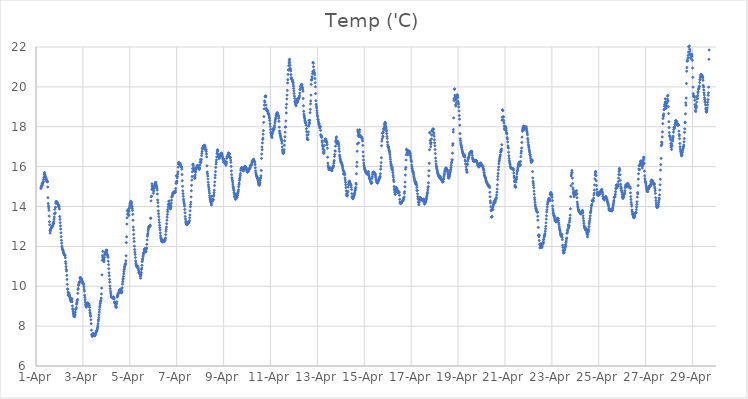
| Category | Temp ('C) |
|---|---|
| 44287.208333333336 | 14.903 |
| 44287.21875 | 14.95 |
| 44287.229166666664 | 15.001 |
| 44287.239583333336 | 15.046 |
| 44287.25 | 15.058 |
| 44287.260416666664 | 15.142 |
| 44287.270833333336 | 15.089 |
| 44287.28125 | 15.154 |
| 44287.291666666664 | 15.194 |
| 44287.302083333336 | 15.213 |
| 44287.3125 | 15.263 |
| 44287.322916666664 | 15.357 |
| 44287.333333333336 | 15.464 |
| 44287.34375 | 15.629 |
| 44287.354166666664 | 15.635 |
| 44287.364583333336 | 15.705 |
| 44287.375 | 15.594 |
| 44287.385416666664 | 15.562 |
| 44287.395833333336 | 15.508 |
| 44287.40625 | 15.463 |
| 44287.416666666664 | 15.451 |
| 44287.427083333336 | 15.418 |
| 44287.4375 | 15.367 |
| 44287.447916666664 | 15.304 |
| 44287.458333333336 | 15.279 |
| 44287.46875 | 15.247 |
| 44287.479166666664 | 15.288 |
| 44287.489583333336 | 15.234 |
| 44287.5 | 14.98 |
| 44287.510416666664 | 14.443 |
| 44287.520833333336 | 14.15 |
| 44287.53125 | 14.023 |
| 44287.541666666664 | 13.929 |
| 44287.552083333336 | 13.81 |
| 44287.5625 | 13.517 |
| 44287.572916666664 | 13.237 |
| 44287.583333333336 | 13.085 |
| 44287.59375 | 12.813 |
| 44287.604166666664 | 12.665 |
| 44287.614583333336 | 12.771 |
| 44287.625 | 12.871 |
| 44287.635416666664 | 12.89 |
| 44287.645833333336 | 12.92 |
| 44287.65625 | 12.944 |
| 44287.666666666664 | 12.97 |
| 44287.677083333336 | 12.98 |
| 44287.6875 | 12.992 |
| 44287.697916666664 | 12.995 |
| 44287.708333333336 | 13.023 |
| 44287.71875 | 13.065 |
| 44287.729166666664 | 13.16 |
| 44287.739583333336 | 13.167 |
| 44287.75 | 13.137 |
| 44287.760416666664 | 13.241 |
| 44287.770833333336 | 13.358 |
| 44287.78125 | 13.471 |
| 44287.791666666664 | 13.627 |
| 44287.802083333336 | 13.861 |
| 44287.8125 | 13.677 |
| 44287.822916666664 | 13.676 |
| 44287.833333333336 | 13.96 |
| 44287.84375 | 14.161 |
| 44287.854166666664 | 14.255 |
| 44287.864583333336 | 14.182 |
| 44287.875 | 14.214 |
| 44287.885416666664 | 14.247 |
| 44287.895833333336 | 14.212 |
| 44287.90625 | 14.196 |
| 44287.916666666664 | 14.177 |
| 44287.927083333336 | 14.136 |
| 44287.9375 | 14.108 |
| 44287.947916666664 | 14.099 |
| 44287.958333333336 | 14.041 |
| 44287.96875 | 13.979 |
| 44287.979166666664 | 14.015 |
| 44287.989583333336 | 13.98 |
| 44288.0 | 13.872 |
| 44288.010416666664 | 13.496 |
| 44288.020833333336 | 13.351 |
| 44288.03125 | 13.186 |
| 44288.041666666664 | 13.024 |
| 44288.052083333336 | 12.872 |
| 44288.0625 | 12.681 |
| 44288.072916666664 | 12.486 |
| 44288.083333333336 | 12.303 |
| 44288.09375 | 12.159 |
| 44288.104166666664 | 12.015 |
| 44288.114583333336 | 11.929 |
| 44288.125 | 11.856 |
| 44288.135416666664 | 11.847 |
| 44288.145833333336 | 11.818 |
| 44288.15625 | 11.776 |
| 44288.166666666664 | 11.723 |
| 44288.177083333336 | 11.68 |
| 44288.1875 | 11.628 |
| 44288.197916666664 | 11.61 |
| 44288.208333333336 | 11.568 |
| 44288.21875 | 11.571 |
| 44288.229166666664 | 11.555 |
| 44288.239583333336 | 11.559 |
| 44288.25 | 11.431 |
| 44288.260416666664 | 11.233 |
| 44288.270833333336 | 11.133 |
| 44288.28125 | 10.983 |
| 44288.291666666664 | 10.846 |
| 44288.302083333336 | 10.765 |
| 44288.3125 | 10.547 |
| 44288.322916666664 | 10.342 |
| 44288.333333333336 | 10.097 |
| 44288.34375 | 9.862 |
| 44288.354166666664 | 9.849 |
| 44288.364583333336 | 9.705 |
| 44288.375 | 9.547 |
| 44288.385416666664 | 9.57 |
| 44288.395833333336 | 9.642 |
| 44288.40625 | 9.667 |
| 44288.416666666664 | 9.592 |
| 44288.427083333336 | 9.5 |
| 44288.4375 | 9.496 |
| 44288.447916666664 | 9.447 |
| 44288.458333333336 | 9.39 |
| 44288.46875 | 9.329 |
| 44288.479166666664 | 9.283 |
| 44288.489583333336 | 9.267 |
| 44288.5 | 9.228 |
| 44288.510416666664 | 9.276 |
| 44288.520833333336 | 9.373 |
| 44288.53125 | 9.367 |
| 44288.541666666664 | 9.231 |
| 44288.552083333336 | 9.011 |
| 44288.5625 | 8.871 |
| 44288.572916666664 | 8.823 |
| 44288.583333333336 | 8.725 |
| 44288.59375 | 8.653 |
| 44288.604166666664 | 8.583 |
| 44288.614583333336 | 8.525 |
| 44288.625 | 8.49 |
| 44288.635416666664 | 8.484 |
| 44288.645833333336 | 8.476 |
| 44288.65625 | 8.542 |
| 44288.666666666664 | 8.591 |
| 44288.677083333336 | 8.704 |
| 44288.6875 | 8.832 |
| 44288.697916666664 | 8.853 |
| 44288.708333333336 | 8.889 |
| 44288.71875 | 8.928 |
| 44288.729166666664 | 9.091 |
| 44288.739583333336 | 9.155 |
| 44288.75 | 9.197 |
| 44288.760416666664 | 9.288 |
| 44288.770833333336 | 9.339 |
| 44288.78125 | 9.646 |
| 44288.791666666664 | 9.835 |
| 44288.802083333336 | 9.886 |
| 44288.8125 | 10.043 |
| 44288.822916666664 | 10.08 |
| 44288.833333333336 | 10.124 |
| 44288.84375 | 10.181 |
| 44288.854166666664 | 10.213 |
| 44288.864583333336 | 10.235 |
| 44288.875 | 10.424 |
| 44288.885416666664 | 10.379 |
| 44288.895833333336 | 10.437 |
| 44288.90625 | 10.432 |
| 44288.916666666664 | 10.391 |
| 44288.927083333336 | 10.372 |
| 44288.9375 | 10.359 |
| 44288.947916666664 | 10.319 |
| 44288.958333333336 | 10.272 |
| 44288.96875 | 10.252 |
| 44288.979166666664 | 10.228 |
| 44288.989583333336 | 10.15 |
| 44289.0 | 10.121 |
| 44289.010416666664 | 10.127 |
| 44289.020833333336 | 10.151 |
| 44289.03125 | 10.085 |
| 44289.041666666664 | 9.977 |
| 44289.052083333336 | 9.847 |
| 44289.0625 | 9.752 |
| 44289.072916666664 | 9.556 |
| 44289.083333333336 | 9.443 |
| 44289.09375 | 9.317 |
| 44289.104166666664 | 9.202 |
| 44289.114583333336 | 9.093 |
| 44289.125 | 9.024 |
| 44289.135416666664 | 8.977 |
| 44289.145833333336 | 8.952 |
| 44289.15625 | 8.994 |
| 44289.166666666664 | 9.071 |
| 44289.177083333336 | 9.113 |
| 44289.1875 | 9.143 |
| 44289.197916666664 | 9.154 |
| 44289.208333333336 | 9.148 |
| 44289.21875 | 9.136 |
| 44289.229166666664 | 9.117 |
| 44289.239583333336 | 9.11 |
| 44289.25 | 9.076 |
| 44289.260416666664 | 9.096 |
| 44289.270833333336 | 9.017 |
| 44289.28125 | 8.942 |
| 44289.291666666664 | 8.795 |
| 44289.302083333336 | 8.688 |
| 44289.3125 | 8.614 |
| 44289.322916666664 | 8.515 |
| 44289.333333333336 | 8.497 |
| 44289.34375 | 8.32 |
| 44289.354166666664 | 8.125 |
| 44289.364583333336 | 7.795 |
| 44289.375 | 7.576 |
| 44289.385416666664 | 7.566 |
| 44289.395833333336 | 7.485 |
| 44289.40625 | 7.521 |
| 44289.416666666664 | 7.602 |
| 44289.427083333336 | 7.629 |
| 44289.4375 | 7.615 |
| 44289.447916666664 | 7.603 |
| 44289.458333333336 | 7.562 |
| 44289.46875 | 7.57 |
| 44289.479166666664 | 7.546 |
| 44289.489583333336 | 7.513 |
| 44289.5 | 7.526 |
| 44289.510416666664 | 7.552 |
| 44289.520833333336 | 7.568 |
| 44289.53125 | 7.566 |
| 44289.541666666664 | 7.597 |
| 44289.552083333336 | 7.667 |
| 44289.5625 | 7.723 |
| 44289.572916666664 | 7.756 |
| 44289.583333333336 | 7.728 |
| 44289.59375 | 7.762 |
| 44289.604166666664 | 7.807 |
| 44289.614583333336 | 7.862 |
| 44289.625 | 7.928 |
| 44289.635416666664 | 8.014 |
| 44289.645833333336 | 8.125 |
| 44289.65625 | 8.26 |
| 44289.666666666664 | 8.33 |
| 44289.677083333336 | 8.437 |
| 44289.6875 | 8.567 |
| 44289.697916666664 | 8.708 |
| 44289.708333333336 | 8.83 |
| 44289.71875 | 8.955 |
| 44289.729166666664 | 9.051 |
| 44289.739583333336 | 9.143 |
| 44289.75 | 9.226 |
| 44289.760416666664 | 9.244 |
| 44289.770833333336 | 9.29 |
| 44289.78125 | 9.405 |
| 44289.791666666664 | 9.614 |
| 44289.802083333336 | 9.907 |
| 44289.8125 | 10.572 |
| 44289.822916666664 | 11.305 |
| 44289.833333333336 | 11.536 |
| 44289.84375 | 11.754 |
| 44289.854166666664 | 11.449 |
| 44289.864583333336 | 11.399 |
| 44289.875 | 11.355 |
| 44289.885416666664 | 11.424 |
| 44289.895833333336 | 11.228 |
| 44289.90625 | 11.313 |
| 44289.916666666664 | 11.455 |
| 44289.927083333336 | 11.579 |
| 44289.9375 | 11.663 |
| 44289.947916666664 | 11.631 |
| 44289.958333333336 | 11.683 |
| 44289.96875 | 11.702 |
| 44289.979166666664 | 11.735 |
| 44289.989583333336 | 11.812 |
| 44290.0 | 11.785 |
| 44290.010416666664 | 11.812 |
| 44290.020833333336 | 11.797 |
| 44290.03125 | 11.667 |
| 44290.041666666664 | 11.573 |
| 44290.052083333336 | 11.548 |
| 44290.0625 | 11.513 |
| 44290.072916666664 | 11.447 |
| 44290.083333333336 | 11.257 |
| 44290.09375 | 11.086 |
| 44290.104166666664 | 10.879 |
| 44290.114583333336 | 10.673 |
| 44290.125 | 10.526 |
| 44290.135416666664 | 10.342 |
| 44290.145833333336 | 10.203 |
| 44290.15625 | 10.014 |
| 44290.166666666664 | 9.881 |
| 44290.177083333336 | 9.754 |
| 44290.1875 | 9.656 |
| 44290.197916666664 | 9.567 |
| 44290.208333333336 | 9.487 |
| 44290.21875 | 9.451 |
| 44290.229166666664 | 9.442 |
| 44290.239583333336 | 9.436 |
| 44290.25 | 9.427 |
| 44290.260416666664 | 9.42 |
| 44290.270833333336 | 9.418 |
| 44290.28125 | 9.415 |
| 44290.291666666664 | 9.415 |
| 44290.302083333336 | 9.463 |
| 44290.3125 | 9.443 |
| 44290.322916666664 | 9.388 |
| 44290.333333333336 | 9.361 |
| 44290.34375 | 9.214 |
| 44290.354166666664 | 9.165 |
| 44290.364583333336 | 9.154 |
| 44290.375 | 9.201 |
| 44290.385416666664 | 9.152 |
| 44290.395833333336 | 9.029 |
| 44290.40625 | 8.954 |
| 44290.416666666664 | 8.972 |
| 44290.427083333336 | 8.943 |
| 44290.4375 | 9.119 |
| 44290.447916666664 | 9.221 |
| 44290.458333333336 | 9.453 |
| 44290.46875 | 9.524 |
| 44290.479166666664 | 9.548 |
| 44290.489583333336 | 9.512 |
| 44290.5 | 9.618 |
| 44290.510416666664 | 9.63 |
| 44290.520833333336 | 9.644 |
| 44290.53125 | 9.686 |
| 44290.541666666664 | 9.739 |
| 44290.552083333336 | 9.801 |
| 44290.5625 | 9.798 |
| 44290.572916666664 | 9.804 |
| 44290.583333333336 | 9.809 |
| 44290.59375 | 9.837 |
| 44290.604166666664 | 9.853 |
| 44290.614583333336 | 9.839 |
| 44290.625 | 9.727 |
| 44290.635416666664 | 9.67 |
| 44290.645833333336 | 9.685 |
| 44290.65625 | 9.689 |
| 44290.666666666664 | 9.76 |
| 44290.677083333336 | 9.92 |
| 44290.6875 | 10.107 |
| 44290.697916666664 | 10.225 |
| 44290.708333333336 | 10.332 |
| 44290.71875 | 10.392 |
| 44290.729166666664 | 10.496 |
| 44290.739583333336 | 10.627 |
| 44290.75 | 10.734 |
| 44290.760416666664 | 10.837 |
| 44290.770833333336 | 10.917 |
| 44290.78125 | 10.981 |
| 44290.791666666664 | 11.053 |
| 44290.802083333336 | 11.107 |
| 44290.8125 | 11.09 |
| 44290.822916666664 | 11.148 |
| 44290.833333333336 | 11.279 |
| 44290.84375 | 11.53 |
| 44290.854166666664 | 12.187 |
| 44290.864583333336 | 12.479 |
| 44290.875 | 13.119 |
| 44290.885416666664 | 13.434 |
| 44290.895833333336 | 13.796 |
| 44290.90625 | 13.624 |
| 44290.916666666664 | 13.808 |
| 44290.927083333336 | 13.733 |
| 44290.9375 | 13.851 |
| 44290.947916666664 | 13.607 |
| 44290.958333333336 | 13.55 |
| 44290.96875 | 13.758 |
| 44290.979166666664 | 13.896 |
| 44290.989583333336 | 13.968 |
| 44291.0 | 14.061 |
| 44291.010416666664 | 14.148 |
| 44291.020833333336 | 14.19 |
| 44291.03125 | 14.181 |
| 44291.041666666664 | 14.261 |
| 44291.052083333336 | 14.227 |
| 44291.0625 | 14.212 |
| 44291.072916666664 | 14.142 |
| 44291.083333333336 | 14.041 |
| 44291.09375 | 14.001 |
| 44291.104166666664 | 13.898 |
| 44291.114583333336 | 13.803 |
| 44291.125 | 13.606 |
| 44291.135416666664 | 13.309 |
| 44291.145833333336 | 12.973 |
| 44291.15625 | 12.823 |
| 44291.166666666664 | 12.603 |
| 44291.177083333336 | 12.409 |
| 44291.1875 | 12.247 |
| 44291.197916666664 | 12.013 |
| 44291.208333333336 | 11.843 |
| 44291.21875 | 11.712 |
| 44291.229166666664 | 11.593 |
| 44291.239583333336 | 11.44 |
| 44291.25 | 11.263 |
| 44291.260416666664 | 11.149 |
| 44291.270833333336 | 11.092 |
| 44291.28125 | 11.049 |
| 44291.291666666664 | 11.014 |
| 44291.302083333336 | 10.988 |
| 44291.3125 | 10.965 |
| 44291.322916666664 | 10.945 |
| 44291.333333333336 | 10.937 |
| 44291.34375 | 11.001 |
| 44291.354166666664 | 10.928 |
| 44291.364583333336 | 10.871 |
| 44291.375 | 10.803 |
| 44291.385416666664 | 10.714 |
| 44291.395833333336 | 10.692 |
| 44291.40625 | 10.707 |
| 44291.416666666664 | 10.633 |
| 44291.427083333336 | 10.623 |
| 44291.4375 | 10.603 |
| 44291.447916666664 | 10.506 |
| 44291.458333333336 | 10.403 |
| 44291.46875 | 10.521 |
| 44291.479166666664 | 10.57 |
| 44291.489583333336 | 10.692 |
| 44291.5 | 10.842 |
| 44291.510416666664 | 10.905 |
| 44291.520833333336 | 11.047 |
| 44291.53125 | 11.234 |
| 44291.541666666664 | 11.31 |
| 44291.552083333336 | 11.38 |
| 44291.5625 | 11.486 |
| 44291.572916666664 | 11.556 |
| 44291.583333333336 | 11.623 |
| 44291.59375 | 11.687 |
| 44291.604166666664 | 11.697 |
| 44291.614583333336 | 11.83 |
| 44291.625 | 11.856 |
| 44291.635416666664 | 11.888 |
| 44291.645833333336 | 11.848 |
| 44291.65625 | 11.861 |
| 44291.666666666664 | 11.77 |
| 44291.677083333336 | 11.725 |
| 44291.6875 | 11.755 |
| 44291.697916666664 | 11.885 |
| 44291.708333333336 | 11.884 |
| 44291.71875 | 11.914 |
| 44291.729166666664 | 12.103 |
| 44291.739583333336 | 12.327 |
| 44291.75 | 12.504 |
| 44291.760416666664 | 12.582 |
| 44291.770833333336 | 12.658 |
| 44291.78125 | 12.775 |
| 44291.791666666664 | 12.858 |
| 44291.802083333336 | 12.92 |
| 44291.8125 | 12.971 |
| 44291.822916666664 | 12.984 |
| 44291.833333333336 | 12.995 |
| 44291.84375 | 13.022 |
| 44291.854166666664 | 12.991 |
| 44291.864583333336 | 13.024 |
| 44291.875 | 13.056 |
| 44291.885416666664 | 13.405 |
| 44291.895833333336 | 13.419 |
| 44291.90625 | 14.282 |
| 44291.916666666664 | 14.49 |
| 44291.927083333336 | 14.519 |
| 44291.9375 | 14.865 |
| 44291.947916666664 | 15.139 |
| 44291.958333333336 | 15.012 |
| 44291.96875 | 14.88 |
| 44291.979166666664 | 14.967 |
| 44291.989583333336 | 15.017 |
| 44292.0 | 14.816 |
| 44292.010416666664 | 14.665 |
| 44292.020833333336 | 14.779 |
| 44292.03125 | 14.901 |
| 44292.041666666664 | 14.953 |
| 44292.052083333336 | 15.013 |
| 44292.0625 | 15.06 |
| 44292.072916666664 | 15.118 |
| 44292.083333333336 | 15.113 |
| 44292.09375 | 15.2 |
| 44292.104166666664 | 15.216 |
| 44292.114583333336 | 15.177 |
| 44292.125 | 15.087 |
| 44292.135416666664 | 15.044 |
| 44292.145833333336 | 14.98 |
| 44292.15625 | 14.904 |
| 44292.166666666664 | 14.823 |
| 44292.177083333336 | 14.632 |
| 44292.1875 | 14.326 |
| 44292.197916666664 | 14.195 |
| 44292.208333333336 | 14.01 |
| 44292.21875 | 13.782 |
| 44292.229166666664 | 13.636 |
| 44292.239583333336 | 13.49 |
| 44292.25 | 13.337 |
| 44292.260416666664 | 13.201 |
| 44292.270833333336 | 13.06 |
| 44292.28125 | 12.945 |
| 44292.291666666664 | 12.823 |
| 44292.302083333336 | 12.675 |
| 44292.3125 | 12.531 |
| 44292.322916666664 | 12.435 |
| 44292.333333333336 | 12.385 |
| 44292.34375 | 12.311 |
| 44292.354166666664 | 12.288 |
| 44292.364583333336 | 12.264 |
| 44292.375 | 12.23 |
| 44292.385416666664 | 12.233 |
| 44292.395833333336 | 12.225 |
| 44292.40625 | 12.292 |
| 44292.416666666664 | 12.326 |
| 44292.427083333336 | 12.273 |
| 44292.4375 | 12.259 |
| 44292.447916666664 | 12.278 |
| 44292.458333333336 | 12.27 |
| 44292.46875 | 12.258 |
| 44292.479166666664 | 12.282 |
| 44292.489583333336 | 12.259 |
| 44292.5 | 12.304 |
| 44292.510416666664 | 12.366 |
| 44292.520833333336 | 12.419 |
| 44292.53125 | 12.589 |
| 44292.541666666664 | 12.757 |
| 44292.552083333336 | 12.858 |
| 44292.5625 | 12.971 |
| 44292.572916666664 | 13.138 |
| 44292.583333333336 | 13.314 |
| 44292.59375 | 13.465 |
| 44292.604166666664 | 13.599 |
| 44292.614583333336 | 13.739 |
| 44292.625 | 13.85 |
| 44292.635416666664 | 13.974 |
| 44292.645833333336 | 14.093 |
| 44292.65625 | 14.126 |
| 44292.666666666664 | 14.254 |
| 44292.677083333336 | 14.282 |
| 44292.6875 | 14.113 |
| 44292.697916666664 | 14.066 |
| 44292.708333333336 | 14.106 |
| 44292.71875 | 14.044 |
| 44292.729166666664 | 13.919 |
| 44292.739583333336 | 13.878 |
| 44292.75 | 13.927 |
| 44292.760416666664 | 14.006 |
| 44292.770833333336 | 14.166 |
| 44292.78125 | 14.315 |
| 44292.791666666664 | 14.469 |
| 44292.802083333336 | 14.496 |
| 44292.8125 | 14.524 |
| 44292.822916666664 | 14.593 |
| 44292.833333333336 | 14.654 |
| 44292.84375 | 14.678 |
| 44292.854166666664 | 14.696 |
| 44292.864583333336 | 14.701 |
| 44292.875 | 14.715 |
| 44292.885416666664 | 14.725 |
| 44292.895833333336 | 14.715 |
| 44292.90625 | 14.678 |
| 44292.916666666664 | 14.71 |
| 44292.927083333336 | 14.7 |
| 44292.9375 | 14.713 |
| 44292.947916666664 | 14.778 |
| 44292.958333333336 | 14.908 |
| 44292.96875 | 15.16 |
| 44292.979166666664 | 15.545 |
| 44292.989583333336 | 15.248 |
| 44293.0 | 15.175 |
| 44293.010416666664 | 15.269 |
| 44293.020833333336 | 15.434 |
| 44293.03125 | 15.51 |
| 44293.041666666664 | 15.633 |
| 44293.052083333336 | 15.74 |
| 44293.0625 | 15.972 |
| 44293.072916666664 | 16.127 |
| 44293.083333333336 | 16.192 |
| 44293.09375 | 16.194 |
| 44293.104166666664 | 16.205 |
| 44293.114583333336 | 16.2 |
| 44293.125 | 16.138 |
| 44293.135416666664 | 16.128 |
| 44293.145833333336 | 16.1 |
| 44293.15625 | 16.129 |
| 44293.166666666664 | 16.099 |
| 44293.177083333336 | 16.01 |
| 44293.1875 | 16.014 |
| 44293.197916666664 | 16.009 |
| 44293.208333333336 | 15.958 |
| 44293.21875 | 15.868 |
| 44293.229166666664 | 15.601 |
| 44293.239583333336 | 15.293 |
| 44293.25 | 15.011 |
| 44293.260416666664 | 14.787 |
| 44293.270833333336 | 14.645 |
| 44293.28125 | 14.511 |
| 44293.291666666664 | 14.372 |
| 44293.302083333336 | 14.273 |
| 44293.3125 | 14.186 |
| 44293.322916666664 | 14.115 |
| 44293.333333333336 | 14.018 |
| 44293.34375 | 13.853 |
| 44293.354166666664 | 13.688 |
| 44293.364583333336 | 13.5 |
| 44293.375 | 13.372 |
| 44293.385416666664 | 13.264 |
| 44293.395833333336 | 13.19 |
| 44293.40625 | 13.145 |
| 44293.416666666664 | 13.111 |
| 44293.427083333336 | 13.09 |
| 44293.4375 | 13.085 |
| 44293.447916666664 | 13.091 |
| 44293.458333333336 | 13.192 |
| 44293.46875 | 13.132 |
| 44293.479166666664 | 13.168 |
| 44293.489583333336 | 13.165 |
| 44293.5 | 13.155 |
| 44293.510416666664 | 13.177 |
| 44293.520833333336 | 13.243 |
| 44293.53125 | 13.232 |
| 44293.541666666664 | 13.287 |
| 44293.552083333336 | 13.436 |
| 44293.5625 | 13.576 |
| 44293.572916666664 | 13.784 |
| 44293.583333333336 | 13.989 |
| 44293.59375 | 14.1 |
| 44293.604166666664 | 14.216 |
| 44293.614583333336 | 14.478 |
| 44293.625 | 14.787 |
| 44293.635416666664 | 15.062 |
| 44293.645833333336 | 15.322 |
| 44293.65625 | 15.505 |
| 44293.666666666664 | 15.744 |
| 44293.677083333336 | 15.901 |
| 44293.6875 | 16.095 |
| 44293.697916666664 | 16.132 |
| 44293.708333333336 | 16.06 |
| 44293.71875 | 15.958 |
| 44293.729166666664 | 15.878 |
| 44293.739583333336 | 15.792 |
| 44293.75 | 15.807 |
| 44293.760416666664 | 15.528 |
| 44293.770833333336 | 15.406 |
| 44293.78125 | 15.46 |
| 44293.791666666664 | 15.579 |
| 44293.802083333336 | 15.711 |
| 44293.8125 | 15.783 |
| 44293.822916666664 | 15.877 |
| 44293.833333333336 | 15.912 |
| 44293.84375 | 15.933 |
| 44293.854166666664 | 15.961 |
| 44293.864583333336 | 16.015 |
| 44293.875 | 16.041 |
| 44293.885416666664 | 16.053 |
| 44293.895833333336 | 16.053 |
| 44293.90625 | 16.039 |
| 44293.916666666664 | 16.007 |
| 44293.927083333336 | 15.961 |
| 44293.9375 | 15.936 |
| 44293.947916666664 | 15.921 |
| 44293.958333333336 | 15.856 |
| 44293.96875 | 15.896 |
| 44293.979166666664 | 15.94 |
| 44293.989583333336 | 16.071 |
| 44294.0 | 16.215 |
| 44294.010416666664 | 16.352 |
| 44294.020833333336 | 16.232 |
| 44294.03125 | 16.197 |
| 44294.041666666664 | 16.273 |
| 44294.052083333336 | 16.363 |
| 44294.0625 | 16.553 |
| 44294.072916666664 | 16.669 |
| 44294.083333333336 | 16.768 |
| 44294.09375 | 16.912 |
| 44294.104166666664 | 16.889 |
| 44294.114583333336 | 16.947 |
| 44294.125 | 17.011 |
| 44294.135416666664 | 16.989 |
| 44294.145833333336 | 17.022 |
| 44294.15625 | 17.038 |
| 44294.166666666664 | 17.037 |
| 44294.177083333336 | 17.057 |
| 44294.1875 | 17.072 |
| 44294.197916666664 | 17.052 |
| 44294.208333333336 | 17.024 |
| 44294.21875 | 16.948 |
| 44294.229166666664 | 16.841 |
| 44294.239583333336 | 16.858 |
| 44294.25 | 16.84 |
| 44294.260416666664 | 16.758 |
| 44294.270833333336 | 16.633 |
| 44294.28125 | 16.484 |
| 44294.291666666664 | 16.04 |
| 44294.302083333336 | 15.729 |
| 44294.3125 | 15.639 |
| 44294.322916666664 | 15.528 |
| 44294.333333333336 | 15.381 |
| 44294.34375 | 15.217 |
| 44294.354166666664 | 15.077 |
| 44294.364583333336 | 14.976 |
| 44294.375 | 14.883 |
| 44294.385416666664 | 14.781 |
| 44294.395833333336 | 14.669 |
| 44294.40625 | 14.538 |
| 44294.416666666664 | 14.455 |
| 44294.427083333336 | 14.366 |
| 44294.4375 | 14.313 |
| 44294.447916666664 | 14.252 |
| 44294.458333333336 | 14.228 |
| 44294.46875 | 14.185 |
| 44294.479166666664 | 14.075 |
| 44294.489583333336 | 14.14 |
| 44294.5 | 14.512 |
| 44294.510416666664 | 14.359 |
| 44294.520833333336 | 14.355 |
| 44294.53125 | 14.307 |
| 44294.541666666664 | 14.279 |
| 44294.552083333336 | 14.338 |
| 44294.5625 | 14.357 |
| 44294.572916666664 | 14.52 |
| 44294.583333333336 | 14.571 |
| 44294.59375 | 14.698 |
| 44294.604166666664 | 14.818 |
| 44294.614583333336 | 15.05 |
| 44294.625 | 15.229 |
| 44294.635416666664 | 15.439 |
| 44294.645833333336 | 15.573 |
| 44294.65625 | 15.754 |
| 44294.666666666664 | 15.96 |
| 44294.677083333336 | 16.128 |
| 44294.6875 | 16.224 |
| 44294.697916666664 | 16.337 |
| 44294.708333333336 | 16.484 |
| 44294.71875 | 16.661 |
| 44294.729166666664 | 16.738 |
| 44294.739583333336 | 16.84 |
| 44294.75 | 16.833 |
| 44294.760416666664 | 16.789 |
| 44294.770833333336 | 16.615 |
| 44294.78125 | 16.521 |
| 44294.791666666664 | 16.584 |
| 44294.802083333336 | 16.469 |
| 44294.8125 | 16.398 |
| 44294.822916666664 | 16.446 |
| 44294.833333333336 | 16.491 |
| 44294.84375 | 16.524 |
| 44294.854166666664 | 16.561 |
| 44294.864583333336 | 16.595 |
| 44294.875 | 16.617 |
| 44294.885416666664 | 16.649 |
| 44294.895833333336 | 16.674 |
| 44294.90625 | 16.672 |
| 44294.916666666664 | 16.661 |
| 44294.927083333336 | 16.625 |
| 44294.9375 | 16.589 |
| 44294.947916666664 | 16.521 |
| 44294.958333333336 | 16.465 |
| 44294.96875 | 16.407 |
| 44294.979166666664 | 16.35 |
| 44294.989583333336 | 16.22 |
| 44295.0 | 16.377 |
| 44295.010416666664 | 16.364 |
| 44295.020833333336 | 16.294 |
| 44295.03125 | 16.267 |
| 44295.041666666664 | 16.251 |
| 44295.052083333336 | 16.255 |
| 44295.0625 | 16.216 |
| 44295.072916666664 | 16.188 |
| 44295.083333333336 | 16.138 |
| 44295.09375 | 16.118 |
| 44295.104166666664 | 16.067 |
| 44295.114583333336 | 16.158 |
| 44295.125 | 16.238 |
| 44295.135416666664 | 16.414 |
| 44295.145833333336 | 16.495 |
| 44295.15625 | 16.465 |
| 44295.166666666664 | 16.501 |
| 44295.177083333336 | 16.545 |
| 44295.1875 | 16.596 |
| 44295.197916666664 | 16.637 |
| 44295.208333333336 | 16.676 |
| 44295.21875 | 16.671 |
| 44295.229166666664 | 16.679 |
| 44295.239583333336 | 16.657 |
| 44295.25 | 16.617 |
| 44295.260416666664 | 16.497 |
| 44295.270833333336 | 16.471 |
| 44295.28125 | 16.467 |
| 44295.291666666664 | 16.445 |
| 44295.302083333336 | 16.327 |
| 44295.3125 | 16.213 |
| 44295.322916666664 | 16.011 |
| 44295.333333333336 | 15.788 |
| 44295.34375 | 15.599 |
| 44295.354166666664 | 15.446 |
| 44295.364583333336 | 15.387 |
| 44295.375 | 15.313 |
| 44295.385416666664 | 15.229 |
| 44295.395833333336 | 15.117 |
| 44295.40625 | 15.008 |
| 44295.416666666664 | 14.936 |
| 44295.427083333336 | 14.868 |
| 44295.4375 | 14.808 |
| 44295.447916666664 | 14.701 |
| 44295.458333333336 | 14.619 |
| 44295.46875 | 14.506 |
| 44295.479166666664 | 14.453 |
| 44295.489583333336 | 14.536 |
| 44295.5 | 14.467 |
| 44295.510416666664 | 14.356 |
| 44295.520833333336 | 14.598 |
| 44295.53125 | 14.63 |
| 44295.541666666664 | 14.588 |
| 44295.552083333336 | 14.501 |
| 44295.5625 | 14.448 |
| 44295.572916666664 | 14.463 |
| 44295.583333333336 | 14.54 |
| 44295.59375 | 14.559 |
| 44295.604166666664 | 14.648 |
| 44295.614583333336 | 14.699 |
| 44295.625 | 14.769 |
| 44295.635416666664 | 14.845 |
| 44295.645833333336 | 14.994 |
| 44295.65625 | 15.097 |
| 44295.666666666664 | 15.176 |
| 44295.677083333336 | 15.308 |
| 44295.6875 | 15.386 |
| 44295.697916666664 | 15.474 |
| 44295.708333333336 | 15.559 |
| 44295.71875 | 15.657 |
| 44295.729166666664 | 15.817 |
| 44295.739583333336 | 15.879 |
| 44295.75 | 15.886 |
| 44295.760416666664 | 15.939 |
| 44295.770833333336 | 15.934 |
| 44295.78125 | 15.94 |
| 44295.791666666664 | 15.937 |
| 44295.802083333336 | 15.9 |
| 44295.8125 | 15.869 |
| 44295.822916666664 | 15.818 |
| 44295.833333333336 | 15.785 |
| 44295.84375 | 15.792 |
| 44295.854166666664 | 15.832 |
| 44295.864583333336 | 15.872 |
| 44295.875 | 15.91 |
| 44295.885416666664 | 15.955 |
| 44295.895833333336 | 15.985 |
| 44295.90625 | 16.001 |
| 44295.916666666664 | 16.011 |
| 44295.927083333336 | 16.004 |
| 44295.9375 | 15.982 |
| 44295.947916666664 | 15.964 |
| 44295.958333333336 | 15.942 |
| 44295.96875 | 15.901 |
| 44295.979166666664 | 15.863 |
| 44295.989583333336 | 15.801 |
| 44296.0 | 15.764 |
| 44296.010416666664 | 15.741 |
| 44296.020833333336 | 15.731 |
| 44296.03125 | 15.725 |
| 44296.041666666664 | 15.772 |
| 44296.052083333336 | 15.819 |
| 44296.0625 | 15.784 |
| 44296.072916666664 | 15.839 |
| 44296.083333333336 | 15.842 |
| 44296.09375 | 15.889 |
| 44296.104166666664 | 15.89 |
| 44296.114583333336 | 15.924 |
| 44296.125 | 15.966 |
| 44296.135416666664 | 15.938 |
| 44296.145833333336 | 16.046 |
| 44296.15625 | 16.058 |
| 44296.166666666664 | 16.082 |
| 44296.177083333336 | 16.078 |
| 44296.1875 | 16.098 |
| 44296.197916666664 | 16.13 |
| 44296.208333333336 | 16.219 |
| 44296.21875 | 16.267 |
| 44296.229166666664 | 16.275 |
| 44296.239583333336 | 16.276 |
| 44296.25 | 16.319 |
| 44296.260416666664 | 16.351 |
| 44296.270833333336 | 16.297 |
| 44296.28125 | 16.369 |
| 44296.291666666664 | 16.333 |
| 44296.302083333336 | 16.272 |
| 44296.3125 | 16.272 |
| 44296.322916666664 | 16.243 |
| 44296.333333333336 | 16.193 |
| 44296.34375 | 16.101 |
| 44296.354166666664 | 15.94 |
| 44296.364583333336 | 15.788 |
| 44296.375 | 15.686 |
| 44296.385416666664 | 15.628 |
| 44296.395833333336 | 15.571 |
| 44296.40625 | 15.53 |
| 44296.416666666664 | 15.505 |
| 44296.427083333336 | 15.482 |
| 44296.4375 | 15.447 |
| 44296.447916666664 | 15.411 |
| 44296.458333333336 | 15.36 |
| 44296.46875 | 15.287 |
| 44296.479166666664 | 15.224 |
| 44296.489583333336 | 15.162 |
| 44296.5 | 15.117 |
| 44296.510416666664 | 15.084 |
| 44296.520833333336 | 15.06 |
| 44296.53125 | 15.111 |
| 44296.541666666664 | 15.136 |
| 44296.552083333336 | 15.211 |
| 44296.5625 | 15.327 |
| 44296.572916666664 | 15.425 |
| 44296.583333333336 | 15.426 |
| 44296.59375 | 15.539 |
| 44296.604166666664 | 15.809 |
| 44296.614583333336 | 16.411 |
| 44296.625 | 16.628 |
| 44296.635416666664 | 16.987 |
| 44296.645833333336 | 16.848 |
| 44296.65625 | 17.185 |
| 44296.666666666664 | 17.363 |
| 44296.677083333336 | 17.437 |
| 44296.6875 | 17.627 |
| 44296.697916666664 | 17.807 |
| 44296.708333333336 | 18.216 |
| 44296.71875 | 18.511 |
| 44296.729166666664 | 18.902 |
| 44296.739583333336 | 19.083 |
| 44296.75 | 19.298 |
| 44296.760416666664 | 19.228 |
| 44296.770833333336 | 19.513 |
| 44296.78125 | 19.531 |
| 44296.791666666664 | 19.546 |
| 44296.802083333336 | 19.496 |
| 44296.8125 | 19.087 |
| 44296.822916666664 | 18.922 |
| 44296.833333333336 | 18.816 |
| 44296.84375 | 18.855 |
| 44296.854166666664 | 18.803 |
| 44296.864583333336 | 18.816 |
| 44296.875 | 18.785 |
| 44296.885416666664 | 18.755 |
| 44296.895833333336 | 18.69 |
| 44296.90625 | 18.664 |
| 44296.916666666664 | 18.655 |
| 44296.927083333336 | 18.608 |
| 44296.9375 | 18.543 |
| 44296.947916666664 | 18.485 |
| 44296.958333333336 | 18.409 |
| 44296.96875 | 18.308 |
| 44296.979166666664 | 18.153 |
| 44296.989583333336 | 18.016 |
| 44297.0 | 17.862 |
| 44297.010416666664 | 17.723 |
| 44297.020833333336 | 17.663 |
| 44297.03125 | 17.587 |
| 44297.041666666664 | 17.551 |
| 44297.052083333336 | 17.52 |
| 44297.0625 | 17.459 |
| 44297.072916666664 | 17.622 |
| 44297.083333333336 | 17.683 |
| 44297.09375 | 17.893 |
| 44297.104166666664 | 17.757 |
| 44297.114583333336 | 17.861 |
| 44297.125 | 17.853 |
| 44297.135416666664 | 17.865 |
| 44297.145833333336 | 17.877 |
| 44297.15625 | 17.936 |
| 44297.166666666664 | 17.981 |
| 44297.177083333336 | 18.07 |
| 44297.1875 | 18.19 |
| 44297.197916666664 | 18.274 |
| 44297.208333333336 | 18.348 |
| 44297.21875 | 18.412 |
| 44297.229166666664 | 18.48 |
| 44297.239583333336 | 18.559 |
| 44297.25 | 18.61 |
| 44297.260416666664 | 18.646 |
| 44297.270833333336 | 18.664 |
| 44297.28125 | 18.694 |
| 44297.291666666664 | 18.703 |
| 44297.302083333336 | 18.694 |
| 44297.3125 | 18.627 |
| 44297.322916666664 | 18.586 |
| 44297.333333333336 | 18.566 |
| 44297.34375 | 18.513 |
| 44297.354166666664 | 18.426 |
| 44297.364583333336 | 18.273 |
| 44297.375 | 17.98 |
| 44297.385416666664 | 17.784 |
| 44297.395833333336 | 17.692 |
| 44297.40625 | 17.648 |
| 44297.416666666664 | 17.587 |
| 44297.427083333336 | 17.541 |
| 44297.4375 | 17.475 |
| 44297.447916666664 | 17.428 |
| 44297.458333333336 | 17.371 |
| 44297.46875 | 17.35 |
| 44297.479166666664 | 17.28 |
| 44297.489583333336 | 17.172 |
| 44297.5 | 16.988 |
| 44297.510416666664 | 16.841 |
| 44297.520833333336 | 16.741 |
| 44297.53125 | 16.687 |
| 44297.541666666664 | 16.671 |
| 44297.552083333336 | 16.68 |
| 44297.5625 | 16.696 |
| 44297.572916666664 | 16.739 |
| 44297.583333333336 | 16.85 |
| 44297.59375 | 17.072 |
| 44297.604166666664 | 17.297 |
| 44297.614583333336 | 17.5 |
| 44297.625 | 17.731 |
| 44297.635416666664 | 17.99 |
| 44297.645833333336 | 17.98 |
| 44297.65625 | 18.291 |
| 44297.666666666664 | 18.95 |
| 44297.677083333336 | 18.692 |
| 44297.6875 | 19.126 |
| 44297.697916666664 | 19.391 |
| 44297.708333333336 | 19.588 |
| 44297.71875 | 19.824 |
| 44297.729166666664 | 20.199 |
| 44297.739583333336 | 20.358 |
| 44297.75 | 20.624 |
| 44297.760416666664 | 20.844 |
| 44297.770833333336 | 20.856 |
| 44297.78125 | 21.066 |
| 44297.791666666664 | 21.206 |
| 44297.802083333336 | 21.315 |
| 44297.8125 | 21.384 |
| 44297.822916666664 | 21.225 |
| 44297.833333333336 | 21.086 |
| 44297.84375 | 20.933 |
| 44297.854166666664 | 20.868 |
| 44297.864583333336 | 20.797 |
| 44297.875 | 20.617 |
| 44297.885416666664 | 20.469 |
| 44297.895833333336 | 20.429 |
| 44297.90625 | 20.389 |
| 44297.916666666664 | 20.369 |
| 44297.927083333336 | 20.351 |
| 44297.9375 | 20.318 |
| 44297.947916666664 | 20.273 |
| 44297.958333333336 | 20.219 |
| 44297.96875 | 20.141 |
| 44297.979166666664 | 20.041 |
| 44297.989583333336 | 19.921 |
| 44298.0 | 19.801 |
| 44298.010416666664 | 19.669 |
| 44298.020833333336 | 19.536 |
| 44298.03125 | 19.42 |
| 44298.041666666664 | 19.28 |
| 44298.052083333336 | 19.221 |
| 44298.0625 | 19.18 |
| 44298.072916666664 | 19.133 |
| 44298.083333333336 | 19.095 |
| 44298.09375 | 19.052 |
| 44298.104166666664 | 19.198 |
| 44298.114583333336 | 19.232 |
| 44298.125 | 19.345 |
| 44298.135416666664 | 19.385 |
| 44298.145833333336 | 19.238 |
| 44298.15625 | 19.235 |
| 44298.166666666664 | 19.318 |
| 44298.177083333336 | 19.376 |
| 44298.1875 | 19.399 |
| 44298.197916666664 | 19.451 |
| 44298.208333333336 | 19.449 |
| 44298.21875 | 19.45 |
| 44298.229166666664 | 19.502 |
| 44298.239583333336 | 19.561 |
| 44298.25 | 19.69 |
| 44298.260416666664 | 19.867 |
| 44298.270833333336 | 19.874 |
| 44298.28125 | 20.005 |
| 44298.291666666664 | 20.025 |
| 44298.302083333336 | 20.08 |
| 44298.3125 | 20.083 |
| 44298.322916666664 | 20.121 |
| 44298.333333333336 | 20.125 |
| 44298.34375 | 20.095 |
| 44298.354166666664 | 19.986 |
| 44298.364583333336 | 19.961 |
| 44298.375 | 19.885 |
| 44298.385416666664 | 19.78 |
| 44298.395833333336 | 19.415 |
| 44298.40625 | 19.051 |
| 44298.416666666664 | 18.776 |
| 44298.427083333336 | 18.639 |
| 44298.4375 | 18.547 |
| 44298.447916666664 | 18.475 |
| 44298.458333333336 | 18.403 |
| 44298.46875 | 18.311 |
| 44298.479166666664 | 18.245 |
| 44298.489583333336 | 18.211 |
| 44298.5 | 18.199 |
| 44298.510416666664 | 18.167 |
| 44298.520833333336 | 18.073 |
| 44298.53125 | 17.904 |
| 44298.541666666664 | 17.751 |
| 44298.552083333336 | 17.585 |
| 44298.5625 | 17.452 |
| 44298.572916666664 | 17.384 |
| 44298.583333333336 | 17.356 |
| 44298.59375 | 17.355 |
| 44298.604166666664 | 17.599 |
| 44298.614583333336 | 17.739 |
| 44298.625 | 18.026 |
| 44298.635416666664 | 18.32 |
| 44298.645833333336 | 18.092 |
| 44298.65625 | 18.215 |
| 44298.666666666664 | 18.175 |
| 44298.677083333336 | 18.322 |
| 44298.6875 | 18.709 |
| 44298.697916666664 | 18.873 |
| 44298.708333333336 | 19.147 |
| 44298.71875 | 19.293 |
| 44298.729166666664 | 19.586 |
| 44298.739583333336 | 20.125 |
| 44298.75 | 20.346 |
| 44298.760416666664 | 20.342 |
| 44298.770833333336 | 20.51 |
| 44298.78125 | 20.435 |
| 44298.791666666664 | 20.667 |
| 44298.802083333336 | 20.764 |
| 44298.8125 | 21.226 |
| 44298.822916666664 | 21.183 |
| 44298.833333333336 | 21.011 |
| 44298.84375 | 20.834 |
| 44298.854166666664 | 20.744 |
| 44298.864583333336 | 20.703 |
| 44298.875 | 20.69 |
| 44298.885416666664 | 20.605 |
| 44298.895833333336 | 20.419 |
| 44298.90625 | 20.207 |
| 44298.916666666664 | 20.006 |
| 44298.927083333336 | 19.664 |
| 44298.9375 | 19.308 |
| 44298.947916666664 | 19.126 |
| 44298.958333333336 | 19.032 |
| 44298.96875 | 18.942 |
| 44298.979166666664 | 18.808 |
| 44298.989583333336 | 18.694 |
| 44299.0 | 18.582 |
| 44299.010416666664 | 18.504 |
| 44299.020833333336 | 18.373 |
| 44299.03125 | 18.357 |
| 44299.041666666664 | 18.283 |
| 44299.052083333336 | 18.203 |
| 44299.0625 | 18.118 |
| 44299.072916666664 | 18.156 |
| 44299.083333333336 | 18.046 |
| 44299.09375 | 18.01 |
| 44299.104166666664 | 17.942 |
| 44299.114583333336 | 17.986 |
| 44299.125 | 18.013 |
| 44299.135416666664 | 17.817 |
| 44299.145833333336 | 17.6 |
| 44299.15625 | 17.556 |
| 44299.166666666664 | 17.504 |
| 44299.177083333336 | 17.523 |
| 44299.1875 | 17.466 |
| 44299.197916666664 | 17.297 |
| 44299.208333333336 | 17.207 |
| 44299.21875 | 17.077 |
| 44299.229166666664 | 17.025 |
| 44299.239583333336 | 16.929 |
| 44299.25 | 16.861 |
| 44299.260416666664 | 16.73 |
| 44299.270833333336 | 16.663 |
| 44299.28125 | 16.704 |
| 44299.291666666664 | 16.792 |
| 44299.302083333336 | 17.054 |
| 44299.3125 | 17.281 |
| 44299.322916666664 | 17.304 |
| 44299.333333333336 | 17.371 |
| 44299.34375 | 17.39 |
| 44299.354166666664 | 17.359 |
| 44299.364583333336 | 17.341 |
| 44299.375 | 17.299 |
| 44299.385416666664 | 17.232 |
| 44299.395833333336 | 17.231 |
| 44299.40625 | 17.204 |
| 44299.416666666664 | 17.1 |
| 44299.427083333336 | 16.924 |
| 44299.4375 | 16.474 |
| 44299.447916666664 | 16.178 |
| 44299.458333333336 | 16.052 |
| 44299.46875 | 15.992 |
| 44299.479166666664 | 15.942 |
| 44299.489583333336 | 15.872 |
| 44299.5 | 15.853 |
| 44299.510416666664 | 15.858 |
| 44299.520833333336 | 15.89 |
| 44299.53125 | 15.914 |
| 44299.541666666664 | 15.93 |
| 44299.552083333336 | 15.925 |
| 44299.5625 | 15.916 |
| 44299.572916666664 | 15.908 |
| 44299.583333333336 | 15.882 |
| 44299.59375 | 15.859 |
| 44299.604166666664 | 15.817 |
| 44299.614583333336 | 15.893 |
| 44299.625 | 15.786 |
| 44299.635416666664 | 15.931 |
| 44299.645833333336 | 15.936 |
| 44299.65625 | 15.936 |
| 44299.666666666664 | 15.958 |
| 44299.677083333336 | 16 |
| 44299.6875 | 16.054 |
| 44299.697916666664 | 16.168 |
| 44299.708333333336 | 16.237 |
| 44299.71875 | 16.31 |
| 44299.729166666664 | 16.51 |
| 44299.739583333336 | 16.605 |
| 44299.75 | 16.788 |
| 44299.760416666664 | 16.78 |
| 44299.770833333336 | 17.027 |
| 44299.78125 | 17.247 |
| 44299.791666666664 | 17.329 |
| 44299.802083333336 | 17.438 |
| 44299.8125 | 17.493 |
| 44299.822916666664 | 17.283 |
| 44299.833333333336 | 17.15 |
| 44299.84375 | 17.205 |
| 44299.854166666664 | 17.221 |
| 44299.864583333336 | 17.272 |
| 44299.875 | 17.248 |
| 44299.885416666664 | 17.202 |
| 44299.895833333336 | 17.168 |
| 44299.90625 | 17.103 |
| 44299.916666666664 | 17.016 |
| 44299.927083333336 | 16.891 |
| 44299.9375 | 16.762 |
| 44299.947916666664 | 16.576 |
| 44299.958333333336 | 16.5 |
| 44299.96875 | 16.414 |
| 44299.979166666664 | 16.366 |
| 44299.989583333336 | 16.297 |
| 44300.0 | 16.253 |
| 44300.010416666664 | 16.221 |
| 44300.020833333336 | 16.192 |
| 44300.03125 | 16.166 |
| 44300.041666666664 | 16.138 |
| 44300.052083333336 | 16.103 |
| 44300.0625 | 16.052 |
| 44300.072916666664 | 15.998 |
| 44300.083333333336 | 15.927 |
| 44300.09375 | 15.838 |
| 44300.104166666664 | 15.8 |
| 44300.114583333336 | 15.648 |
| 44300.125 | 15.623 |
| 44300.135416666664 | 15.672 |
| 44300.145833333336 | 15.727 |
| 44300.15625 | 15.631 |
| 44300.166666666664 | 15.595 |
| 44300.177083333336 | 15.437 |
| 44300.1875 | 15.33 |
| 44300.197916666664 | 15.214 |
| 44300.208333333336 | 15.094 |
| 44300.21875 | 14.952 |
| 44300.229166666664 | 14.786 |
| 44300.239583333336 | 14.633 |
| 44300.25 | 14.567 |
| 44300.260416666664 | 14.536 |
| 44300.270833333336 | 14.523 |
| 44300.28125 | 14.572 |
| 44300.291666666664 | 14.701 |
| 44300.302083333336 | 14.756 |
| 44300.3125 | 14.973 |
| 44300.322916666664 | 15.108 |
| 44300.333333333336 | 15.111 |
| 44300.34375 | 15.232 |
| 44300.354166666664 | 15.245 |
| 44300.364583333336 | 15.191 |
| 44300.375 | 15.262 |
| 44300.385416666664 | 15.23 |
| 44300.395833333336 | 15.155 |
| 44300.40625 | 15.099 |
| 44300.416666666664 | 15.131 |
| 44300.427083333336 | 15.106 |
| 44300.4375 | 15.063 |
| 44300.447916666664 | 14.967 |
| 44300.458333333336 | 14.848 |
| 44300.46875 | 14.646 |
| 44300.479166666664 | 14.497 |
| 44300.489583333336 | 14.442 |
| 44300.5 | 14.427 |
| 44300.510416666664 | 14.406 |
| 44300.520833333336 | 14.384 |
| 44300.53125 | 14.464 |
| 44300.541666666664 | 14.468 |
| 44300.552083333336 | 14.512 |
| 44300.5625 | 14.553 |
| 44300.572916666664 | 14.593 |
| 44300.583333333336 | 14.636 |
| 44300.59375 | 14.682 |
| 44300.604166666664 | 14.777 |
| 44300.614583333336 | 14.825 |
| 44300.625 | 14.89 |
| 44300.635416666664 | 14.958 |
| 44300.645833333336 | 15.166 |
| 44300.65625 | 15.111 |
| 44300.666666666664 | 15.644 |
| 44300.677083333336 | 16.014 |
| 44300.6875 | 16.22 |
| 44300.697916666664 | 16.773 |
| 44300.708333333336 | 17.141 |
| 44300.71875 | 17.837 |
| 44300.729166666664 | 17.754 |
| 44300.739583333336 | 17.561 |
| 44300.75 | 17.676 |
| 44300.760416666664 | 17.191 |
| 44300.770833333336 | 17.583 |
| 44300.78125 | 17.501 |
| 44300.791666666664 | 17.73 |
| 44300.802083333336 | 17.851 |
| 44300.8125 | 17.598 |
| 44300.822916666664 | 17.565 |
| 44300.833333333336 | 17.523 |
| 44300.84375 | 17.517 |
| 44300.854166666664 | 17.516 |
| 44300.864583333336 | 17.509 |
| 44300.875 | 17.485 |
| 44300.885416666664 | 17.461 |
| 44300.895833333336 | 17.439 |
| 44300.90625 | 17.429 |
| 44300.916666666664 | 17.393 |
| 44300.927083333336 | 17.293 |
| 44300.9375 | 17.066 |
| 44300.947916666664 | 16.737 |
| 44300.958333333336 | 16.521 |
| 44300.96875 | 16.33 |
| 44300.979166666664 | 16.175 |
| 44300.989583333336 | 16.068 |
| 44301.0 | 15.983 |
| 44301.010416666664 | 15.92 |
| 44301.020833333336 | 15.864 |
| 44301.03125 | 15.841 |
| 44301.041666666664 | 15.797 |
| 44301.052083333336 | 15.777 |
| 44301.0625 | 15.737 |
| 44301.072916666664 | 15.723 |
| 44301.083333333336 | 15.704 |
| 44301.09375 | 15.673 |
| 44301.104166666664 | 15.648 |
| 44301.114583333336 | 15.632 |
| 44301.125 | 15.635 |
| 44301.135416666664 | 15.635 |
| 44301.145833333336 | 15.64 |
| 44301.15625 | 15.643 |
| 44301.166666666664 | 15.703 |
| 44301.177083333336 | 15.754 |
| 44301.1875 | 15.615 |
| 44301.197916666664 | 15.554 |
| 44301.208333333336 | 15.485 |
| 44301.21875 | 15.41 |
| 44301.229166666664 | 15.393 |
| 44301.239583333336 | 15.389 |
| 44301.25 | 15.343 |
| 44301.260416666664 | 15.313 |
| 44301.270833333336 | 15.245 |
| 44301.28125 | 15.225 |
| 44301.291666666664 | 15.156 |
| 44301.302083333336 | 15.188 |
| 44301.3125 | 15.193 |
| 44301.322916666664 | 15.205 |
| 44301.333333333336 | 15.414 |
| 44301.34375 | 15.49 |
| 44301.354166666664 | 15.595 |
| 44301.364583333336 | 15.641 |
| 44301.375 | 15.691 |
| 44301.385416666664 | 15.718 |
| 44301.395833333336 | 15.715 |
| 44301.40625 | 15.727 |
| 44301.416666666664 | 15.722 |
| 44301.427083333336 | 15.705 |
| 44301.4375 | 15.661 |
| 44301.447916666664 | 15.647 |
| 44301.458333333336 | 15.642 |
| 44301.46875 | 15.594 |
| 44301.479166666664 | 15.534 |
| 44301.489583333336 | 15.454 |
| 44301.5 | 15.365 |
| 44301.510416666664 | 15.303 |
| 44301.520833333336 | 15.265 |
| 44301.53125 | 15.25 |
| 44301.541666666664 | 15.214 |
| 44301.552083333336 | 15.187 |
| 44301.5625 | 15.178 |
| 44301.572916666664 | 15.196 |
| 44301.583333333336 | 15.239 |
| 44301.59375 | 15.272 |
| 44301.604166666664 | 15.297 |
| 44301.614583333336 | 15.319 |
| 44301.625 | 15.348 |
| 44301.635416666664 | 15.4 |
| 44301.645833333336 | 15.403 |
| 44301.65625 | 15.471 |
| 44301.666666666664 | 15.467 |
| 44301.677083333336 | 15.513 |
| 44301.6875 | 15.645 |
| 44301.697916666664 | 15.874 |
| 44301.708333333336 | 16.017 |
| 44301.71875 | 16.203 |
| 44301.729166666664 | 16.446 |
| 44301.739583333336 | 17.052 |
| 44301.75 | 17.281 |
| 44301.760416666664 | 17.39 |
| 44301.770833333336 | 17.681 |
| 44301.78125 | 17.684 |
| 44301.791666666664 | 17.527 |
| 44301.802083333336 | 17.492 |
| 44301.8125 | 17.729 |
| 44301.822916666664 | 17.896 |
| 44301.833333333336 | 17.83 |
| 44301.84375 | 17.905 |
| 44301.854166666664 | 18.009 |
| 44301.864583333336 | 18.122 |
| 44301.875 | 18.142 |
| 44301.885416666664 | 18.225 |
| 44301.895833333336 | 18.215 |
| 44301.90625 | 18.151 |
| 44301.916666666664 | 18.047 |
| 44301.927083333336 | 17.973 |
| 44301.9375 | 17.884 |
| 44301.947916666664 | 17.785 |
| 44301.958333333336 | 17.66 |
| 44301.96875 | 17.516 |
| 44301.979166666664 | 17.414 |
| 44301.989583333336 | 17.237 |
| 44302.0 | 17.1 |
| 44302.010416666664 | 17.025 |
| 44302.020833333336 | 17.003 |
| 44302.03125 | 16.984 |
| 44302.041666666664 | 16.936 |
| 44302.052083333336 | 16.878 |
| 44302.0625 | 16.819 |
| 44302.072916666664 | 16.764 |
| 44302.083333333336 | 16.689 |
| 44302.09375 | 16.59 |
| 44302.104166666664 | 16.478 |
| 44302.114583333336 | 16.364 |
| 44302.125 | 16.249 |
| 44302.135416666664 | 16.162 |
| 44302.145833333336 | 16.096 |
| 44302.15625 | 16.022 |
| 44302.166666666664 | 15.929 |
| 44302.177083333336 | 15.871 |
| 44302.1875 | 15.984 |
| 44302.197916666664 | 15.926 |
| 44302.208333333336 | 15.804 |
| 44302.21875 | 15.697 |
| 44302.229166666664 | 15.571 |
| 44302.239583333336 | 15.47 |
| 44302.25 | 15.34 |
| 44302.260416666664 | 15.252 |
| 44302.270833333336 | 15.004 |
| 44302.28125 | 14.87 |
| 44302.291666666664 | 14.793 |
| 44302.302083333336 | 14.707 |
| 44302.3125 | 14.619 |
| 44302.322916666664 | 14.615 |
| 44302.333333333336 | 14.72 |
| 44302.34375 | 14.924 |
| 44302.354166666664 | 14.862 |
| 44302.364583333336 | 14.953 |
| 44302.375 | 14.944 |
| 44302.385416666664 | 14.901 |
| 44302.395833333336 | 14.845 |
| 44302.40625 | 14.811 |
| 44302.416666666664 | 14.78 |
| 44302.427083333336 | 14.774 |
| 44302.4375 | 14.704 |
| 44302.447916666664 | 14.692 |
| 44302.458333333336 | 14.721 |
| 44302.46875 | 14.717 |
| 44302.479166666664 | 14.738 |
| 44302.489583333336 | 14.713 |
| 44302.5 | 14.563 |
| 44302.510416666664 | 14.359 |
| 44302.520833333336 | 14.229 |
| 44302.53125 | 14.156 |
| 44302.541666666664 | 14.187 |
| 44302.552083333336 | 14.177 |
| 44302.5625 | 14.168 |
| 44302.572916666664 | 14.175 |
| 44302.583333333336 | 14.178 |
| 44302.59375 | 14.195 |
| 44302.604166666664 | 14.235 |
| 44302.614583333336 | 14.258 |
| 44302.625 | 14.263 |
| 44302.635416666664 | 14.274 |
| 44302.645833333336 | 14.301 |
| 44302.65625 | 14.318 |
| 44302.666666666664 | 14.339 |
| 44302.677083333336 | 14.377 |
| 44302.6875 | 14.454 |
| 44302.697916666664 | 14.475 |
| 44302.708333333336 | 14.664 |
| 44302.71875 | 14.745 |
| 44302.729166666664 | 14.993 |
| 44302.739583333336 | 15.226 |
| 44302.75 | 15.575 |
| 44302.760416666664 | 15.872 |
| 44302.770833333336 | 15.965 |
| 44302.78125 | 16.327 |
| 44302.791666666664 | 16.596 |
| 44302.802083333336 | 16.867 |
| 44302.8125 | 16.825 |
| 44302.822916666664 | 16.679 |
| 44302.833333333336 | 16.697 |
| 44302.84375 | 16.723 |
| 44302.854166666664 | 16.592 |
| 44302.864583333336 | 16.813 |
| 44302.875 | 16.651 |
| 44302.885416666664 | 16.695 |
| 44302.895833333336 | 16.749 |
| 44302.90625 | 16.754 |
| 44302.916666666664 | 16.772 |
| 44302.927083333336 | 16.764 |
| 44302.9375 | 16.729 |
| 44302.947916666664 | 16.708 |
| 44302.958333333336 | 16.661 |
| 44302.96875 | 16.568 |
| 44302.979166666664 | 16.488 |
| 44302.989583333336 | 16.383 |
| 44303.0 | 16.3 |
| 44303.010416666664 | 16.244 |
| 44303.020833333336 | 16.089 |
| 44303.03125 | 15.983 |
| 44303.041666666664 | 15.905 |
| 44303.052083333336 | 15.827 |
| 44303.0625 | 15.783 |
| 44303.072916666664 | 15.746 |
| 44303.083333333336 | 15.717 |
| 44303.09375 | 15.682 |
| 44303.104166666664 | 15.601 |
| 44303.114583333336 | 15.519 |
| 44303.125 | 15.441 |
| 44303.135416666664 | 15.387 |
| 44303.145833333336 | 15.327 |
| 44303.15625 | 15.27 |
| 44303.166666666664 | 15.208 |
| 44303.177083333336 | 15.177 |
| 44303.1875 | 15.134 |
| 44303.197916666664 | 15.166 |
| 44303.208333333336 | 15.229 |
| 44303.21875 | 15.133 |
| 44303.229166666664 | 15.065 |
| 44303.239583333336 | 14.959 |
| 44303.25 | 14.805 |
| 44303.260416666664 | 14.802 |
| 44303.270833333336 | 14.64 |
| 44303.28125 | 14.5 |
| 44303.291666666664 | 14.396 |
| 44303.302083333336 | 14.355 |
| 44303.3125 | 14.207 |
| 44303.322916666664 | 14.089 |
| 44303.333333333336 | 14.193 |
| 44303.34375 | 14.247 |
| 44303.354166666664 | 14.352 |
| 44303.364583333336 | 14.379 |
| 44303.375 | 14.453 |
| 44303.385416666664 | 14.439 |
| 44303.395833333336 | 14.427 |
| 44303.40625 | 14.402 |
| 44303.416666666664 | 14.381 |
| 44303.427083333336 | 14.353 |
| 44303.4375 | 14.361 |
| 44303.447916666664 | 14.343 |
| 44303.458333333336 | 14.32 |
| 44303.46875 | 14.359 |
| 44303.479166666664 | 14.328 |
| 44303.489583333336 | 14.297 |
| 44303.5 | 14.3 |
| 44303.510416666664 | 14.337 |
| 44303.520833333336 | 14.355 |
| 44303.53125 | 14.365 |
| 44303.541666666664 | 14.349 |
| 44303.552083333336 | 14.291 |
| 44303.5625 | 14.208 |
| 44303.572916666664 | 14.117 |
| 44303.583333333336 | 14.154 |
| 44303.59375 | 14.174 |
| 44303.604166666664 | 14.208 |
| 44303.614583333336 | 14.252 |
| 44303.625 | 14.28 |
| 44303.635416666664 | 14.326 |
| 44303.645833333336 | 14.372 |
| 44303.65625 | 14.438 |
| 44303.666666666664 | 14.514 |
| 44303.677083333336 | 14.577 |
| 44303.6875 | 14.649 |
| 44303.697916666664 | 14.717 |
| 44303.708333333336 | 14.83 |
| 44303.71875 | 14.938 |
| 44303.729166666664 | 14.996 |
| 44303.739583333336 | 15.189 |
| 44303.75 | 15.533 |
| 44303.760416666664 | 15.795 |
| 44303.770833333336 | 16.166 |
| 44303.78125 | 16.848 |
| 44303.791666666664 | 17.713 |
| 44303.802083333336 | 17.678 |
| 44303.8125 | 17.312 |
| 44303.822916666664 | 17.189 |
| 44303.833333333336 | 16.996 |
| 44303.84375 | 17.128 |
| 44303.854166666664 | 17.201 |
| 44303.864583333336 | 17.39 |
| 44303.875 | 17.584 |
| 44303.885416666664 | 17.795 |
| 44303.895833333336 | 17.817 |
| 44303.90625 | 17.811 |
| 44303.916666666664 | 17.858 |
| 44303.927083333336 | 17.885 |
| 44303.9375 | 17.891 |
| 44303.947916666664 | 17.873 |
| 44303.958333333336 | 17.711 |
| 44303.96875 | 17.652 |
| 44303.979166666664 | 17.526 |
| 44303.989583333336 | 17.346 |
| 44304.0 | 17.191 |
| 44304.010416666664 | 17.047 |
| 44304.020833333336 | 16.856 |
| 44304.03125 | 16.653 |
| 44304.041666666664 | 16.431 |
| 44304.052083333336 | 16.276 |
| 44304.0625 | 16.138 |
| 44304.072916666664 | 16.037 |
| 44304.083333333336 | 15.972 |
| 44304.09375 | 15.917 |
| 44304.104166666664 | 15.848 |
| 44304.114583333336 | 15.782 |
| 44304.125 | 15.717 |
| 44304.135416666664 | 15.663 |
| 44304.145833333336 | 15.626 |
| 44304.15625 | 15.603 |
| 44304.166666666664 | 15.569 |
| 44304.177083333336 | 15.529 |
| 44304.1875 | 15.503 |
| 44304.197916666664 | 15.474 |
| 44304.208333333336 | 15.452 |
| 44304.21875 | 15.433 |
| 44304.229166666664 | 15.423 |
| 44304.239583333336 | 15.515 |
| 44304.25 | 15.461 |
| 44304.260416666664 | 15.411 |
| 44304.270833333336 | 15.38 |
| 44304.28125 | 15.359 |
| 44304.291666666664 | 15.382 |
| 44304.302083333336 | 15.324 |
| 44304.3125 | 15.311 |
| 44304.322916666664 | 15.277 |
| 44304.333333333336 | 15.239 |
| 44304.34375 | 15.24 |
| 44304.354166666664 | 15.231 |
| 44304.364583333336 | 15.244 |
| 44304.375 | 15.379 |
| 44304.385416666664 | 15.377 |
| 44304.395833333336 | 15.493 |
| 44304.40625 | 15.572 |
| 44304.416666666664 | 15.635 |
| 44304.427083333336 | 15.736 |
| 44304.4375 | 15.789 |
| 44304.447916666664 | 15.844 |
| 44304.458333333336 | 15.895 |
| 44304.46875 | 15.904 |
| 44304.479166666664 | 15.92 |
| 44304.489583333336 | 15.931 |
| 44304.5 | 15.919 |
| 44304.510416666664 | 15.861 |
| 44304.520833333336 | 15.846 |
| 44304.53125 | 15.856 |
| 44304.541666666664 | 15.809 |
| 44304.552083333336 | 15.75 |
| 44304.5625 | 15.681 |
| 44304.572916666664 | 15.587 |
| 44304.583333333336 | 15.487 |
| 44304.59375 | 15.438 |
| 44304.604166666664 | 15.422 |
| 44304.614583333336 | 15.443 |
| 44304.625 | 15.509 |
| 44304.635416666664 | 15.57 |
| 44304.645833333336 | 15.625 |
| 44304.65625 | 15.693 |
| 44304.666666666664 | 15.755 |
| 44304.677083333336 | 15.837 |
| 44304.6875 | 15.856 |
| 44304.697916666664 | 15.956 |
| 44304.708333333336 | 16.065 |
| 44304.71875 | 16.189 |
| 44304.729166666664 | 16.225 |
| 44304.739583333336 | 16.341 |
| 44304.75 | 16.333 |
| 44304.760416666664 | 16.675 |
| 44304.770833333336 | 17.071 |
| 44304.78125 | 17.154 |
| 44304.791666666664 | 17.736 |
| 44304.802083333336 | 17.858 |
| 44304.8125 | 18.446 |
| 44304.822916666664 | 19.32 |
| 44304.833333333336 | 19.421 |
| 44304.84375 | 19.877 |
| 44304.854166666664 | 19.898 |
| 44304.864583333336 | 19.583 |
| 44304.875 | 19.495 |
| 44304.885416666664 | 19.345 |
| 44304.895833333336 | 19.101 |
| 44304.90625 | 19.036 |
| 44304.916666666664 | 19.206 |
| 44304.927083333336 | 19.378 |
| 44304.9375 | 19.481 |
| 44304.947916666664 | 19.54 |
| 44304.958333333336 | 19.6 |
| 44304.96875 | 19.596 |
| 44304.979166666664 | 19.539 |
| 44304.989583333336 | 19.466 |
| 44305.0 | 19.278 |
| 44305.010416666664 | 19.196 |
| 44305.020833333336 | 19.132 |
| 44305.03125 | 18.99 |
| 44305.041666666664 | 18.794 |
| 44305.052083333336 | 18.562 |
| 44305.0625 | 18.38 |
| 44305.072916666664 | 18.079 |
| 44305.083333333336 | 17.658 |
| 44305.09375 | 17.4 |
| 44305.104166666664 | 17.296 |
| 44305.114583333336 | 17.186 |
| 44305.125 | 17.114 |
| 44305.135416666664 | 17.054 |
| 44305.145833333336 | 16.981 |
| 44305.15625 | 16.939 |
| 44305.166666666664 | 16.857 |
| 44305.177083333336 | 16.788 |
| 44305.1875 | 16.736 |
| 44305.197916666664 | 16.707 |
| 44305.208333333336 | 16.669 |
| 44305.21875 | 16.628 |
| 44305.229166666664 | 16.575 |
| 44305.239583333336 | 16.53 |
| 44305.25 | 16.531 |
| 44305.260416666664 | 16.512 |
| 44305.270833333336 | 16.573 |
| 44305.28125 | 16.553 |
| 44305.291666666664 | 16.476 |
| 44305.302083333336 | 16.325 |
| 44305.3125 | 16.278 |
| 44305.322916666664 | 16.135 |
| 44305.333333333336 | 16.137 |
| 44305.34375 | 15.986 |
| 44305.354166666664 | 15.86 |
| 44305.364583333336 | 15.834 |
| 44305.375 | 15.738 |
| 44305.385416666664 | 15.716 |
| 44305.395833333336 | 16.11 |
| 44305.40625 | 16.113 |
| 44305.416666666664 | 16.268 |
| 44305.427083333336 | 16.404 |
| 44305.4375 | 16.379 |
| 44305.447916666664 | 16.471 |
| 44305.458333333336 | 16.469 |
| 44305.46875 | 16.538 |
| 44305.479166666664 | 16.586 |
| 44305.489583333336 | 16.658 |
| 44305.5 | 16.667 |
| 44305.510416666664 | 16.693 |
| 44305.520833333336 | 16.715 |
| 44305.53125 | 16.748 |
| 44305.541666666664 | 16.737 |
| 44305.552083333336 | 16.727 |
| 44305.5625 | 16.747 |
| 44305.572916666664 | 16.772 |
| 44305.583333333336 | 16.766 |
| 44305.59375 | 16.686 |
| 44305.604166666664 | 16.567 |
| 44305.614583333336 | 16.459 |
| 44305.625 | 16.391 |
| 44305.635416666664 | 16.354 |
| 44305.645833333336 | 16.329 |
| 44305.65625 | 16.287 |
| 44305.666666666664 | 16.27 |
| 44305.677083333336 | 16.273 |
| 44305.6875 | 16.269 |
| 44305.697916666664 | 16.277 |
| 44305.708333333336 | 16.293 |
| 44305.71875 | 16.299 |
| 44305.729166666664 | 16.318 |
| 44305.739583333336 | 16.316 |
| 44305.75 | 16.285 |
| 44305.760416666664 | 16.307 |
| 44305.770833333336 | 16.294 |
| 44305.78125 | 16.298 |
| 44305.791666666664 | 16.278 |
| 44305.802083333336 | 16.224 |
| 44305.8125 | 16.197 |
| 44305.822916666664 | 16.163 |
| 44305.833333333336 | 16.133 |
| 44305.84375 | 16.052 |
| 44305.854166666664 | 16.054 |
| 44305.864583333336 | 16.049 |
| 44305.875 | 16.028 |
| 44305.885416666664 | 15.975 |
| 44305.895833333336 | 16.042 |
| 44305.90625 | 16.028 |
| 44305.916666666664 | 16.016 |
| 44305.927083333336 | 16.053 |
| 44305.9375 | 16.142 |
| 44305.947916666664 | 16.176 |
| 44305.958333333336 | 16.169 |
| 44305.96875 | 16.174 |
| 44305.979166666664 | 16.137 |
| 44305.989583333336 | 16.116 |
| 44306.0 | 16.091 |
| 44306.010416666664 | 16.099 |
| 44306.020833333336 | 16.021 |
| 44306.03125 | 16.043 |
| 44306.041666666664 | 16.03 |
| 44306.052083333336 | 16.029 |
| 44306.0625 | 16.002 |
| 44306.072916666664 | 15.92 |
| 44306.083333333336 | 15.873 |
| 44306.09375 | 15.809 |
| 44306.104166666664 | 15.708 |
| 44306.114583333336 | 15.629 |
| 44306.125 | 15.563 |
| 44306.135416666664 | 15.531 |
| 44306.145833333336 | 15.496 |
| 44306.15625 | 15.471 |
| 44306.166666666664 | 15.435 |
| 44306.177083333336 | 15.39 |
| 44306.1875 | 15.33 |
| 44306.197916666664 | 15.288 |
| 44306.208333333336 | 15.251 |
| 44306.21875 | 15.219 |
| 44306.229166666664 | 15.184 |
| 44306.239583333336 | 15.158 |
| 44306.25 | 15.134 |
| 44306.260416666664 | 15.113 |
| 44306.270833333336 | 15.095 |
| 44306.28125 | 15.071 |
| 44306.291666666664 | 15.034 |
| 44306.302083333336 | 15.044 |
| 44306.3125 | 15.03 |
| 44306.322916666664 | 15.023 |
| 44306.333333333336 | 15.012 |
| 44306.34375 | 14.947 |
| 44306.354166666664 | 14.716 |
| 44306.364583333336 | 14.483 |
| 44306.375 | 14.278 |
| 44306.385416666664 | 14.18 |
| 44306.395833333336 | 13.984 |
| 44306.40625 | 13.789 |
| 44306.416666666664 | 13.823 |
| 44306.427083333336 | 13.467 |
| 44306.4375 | 13.481 |
| 44306.447916666664 | 13.499 |
| 44306.458333333336 | 13.879 |
| 44306.46875 | 13.835 |
| 44306.479166666664 | 13.854 |
| 44306.489583333336 | 13.978 |
| 44306.5 | 14.048 |
| 44306.510416666664 | 14.101 |
| 44306.520833333336 | 14.173 |
| 44306.53125 | 14.229 |
| 44306.541666666664 | 14.254 |
| 44306.552083333336 | 14.252 |
| 44306.5625 | 14.305 |
| 44306.572916666664 | 14.186 |
| 44306.583333333336 | 14.235 |
| 44306.59375 | 14.362 |
| 44306.604166666664 | 14.339 |
| 44306.614583333336 | 14.383 |
| 44306.625 | 14.393 |
| 44306.635416666664 | 14.459 |
| 44306.645833333336 | 14.581 |
| 44306.65625 | 14.717 |
| 44306.666666666664 | 14.875 |
| 44306.677083333336 | 15.089 |
| 44306.6875 | 15.351 |
| 44306.697916666664 | 15.507 |
| 44306.708333333336 | 15.655 |
| 44306.71875 | 15.841 |
| 44306.729166666664 | 15.981 |
| 44306.739583333336 | 16.138 |
| 44306.75 | 16.238 |
| 44306.760416666664 | 16.311 |
| 44306.770833333336 | 16.396 |
| 44306.78125 | 16.477 |
| 44306.791666666664 | 16.535 |
| 44306.802083333336 | 16.585 |
| 44306.8125 | 16.714 |
| 44306.822916666664 | 16.798 |
| 44306.833333333336 | 16.828 |
| 44306.84375 | 16.787 |
| 44306.854166666664 | 16.885 |
| 44306.864583333336 | 17.098 |
| 44306.875 | 18.325 |
| 44306.885416666664 | 18.478 |
| 44306.895833333336 | 18.855 |
| 44306.90625 | 18.807 |
| 44306.916666666664 | 18.347 |
| 44306.927083333336 | 18.496 |
| 44306.9375 | 18.502 |
| 44306.947916666664 | 18.301 |
| 44306.958333333336 | 18.188 |
| 44306.96875 | 18.03 |
| 44306.979166666664 | 17.865 |
| 44306.989583333336 | 17.907 |
| 44307.0 | 17.97 |
| 44307.010416666664 | 18.023 |
| 44307.020833333336 | 18.003 |
| 44307.03125 | 17.954 |
| 44307.041666666664 | 17.901 |
| 44307.052083333336 | 17.801 |
| 44307.0625 | 17.715 |
| 44307.072916666664 | 17.653 |
| 44307.083333333336 | 17.642 |
| 44307.09375 | 17.458 |
| 44307.104166666664 | 17.382 |
| 44307.114583333336 | 17.237 |
| 44307.125 | 17.044 |
| 44307.135416666664 | 16.974 |
| 44307.145833333336 | 16.927 |
| 44307.15625 | 16.721 |
| 44307.166666666664 | 16.549 |
| 44307.177083333336 | 16.417 |
| 44307.1875 | 16.31 |
| 44307.197916666664 | 16.23 |
| 44307.208333333336 | 16.166 |
| 44307.21875 | 16.092 |
| 44307.229166666664 | 16.018 |
| 44307.239583333336 | 15.978 |
| 44307.25 | 15.942 |
| 44307.260416666664 | 15.923 |
| 44307.270833333336 | 15.911 |
| 44307.28125 | 15.913 |
| 44307.291666666664 | 15.915 |
| 44307.302083333336 | 15.913 |
| 44307.3125 | 15.904 |
| 44307.322916666664 | 15.883 |
| 44307.333333333336 | 15.892 |
| 44307.34375 | 15.887 |
| 44307.354166666664 | 15.884 |
| 44307.364583333336 | 15.812 |
| 44307.375 | 15.676 |
| 44307.385416666664 | 15.528 |
| 44307.395833333336 | 15.442 |
| 44307.40625 | 15.252 |
| 44307.416666666664 | 15.303 |
| 44307.427083333336 | 15.066 |
| 44307.4375 | 15 |
| 44307.447916666664 | 14.995 |
| 44307.458333333336 | 14.962 |
| 44307.46875 | 15.224 |
| 44307.479166666664 | 15.365 |
| 44307.489583333336 | 15.395 |
| 44307.5 | 15.485 |
| 44307.510416666664 | 15.63 |
| 44307.520833333336 | 15.739 |
| 44307.53125 | 15.807 |
| 44307.541666666664 | 15.877 |
| 44307.552083333336 | 15.955 |
| 44307.5625 | 16.041 |
| 44307.572916666664 | 16.1 |
| 44307.583333333336 | 16.16 |
| 44307.59375 | 16.172 |
| 44307.604166666664 | 16.234 |
| 44307.614583333336 | 16.189 |
| 44307.625 | 16.052 |
| 44307.635416666664 | 16.054 |
| 44307.645833333336 | 16.082 |
| 44307.65625 | 16.104 |
| 44307.666666666664 | 16.263 |
| 44307.677083333336 | 16.503 |
| 44307.6875 | 16.673 |
| 44307.697916666664 | 16.775 |
| 44307.708333333336 | 16.93 |
| 44307.71875 | 17.21 |
| 44307.729166666664 | 17.479 |
| 44307.739583333336 | 17.774 |
| 44307.75 | 17.84 |
| 44307.760416666664 | 17.898 |
| 44307.770833333336 | 17.954 |
| 44307.78125 | 18.01 |
| 44307.791666666664 | 18.016 |
| 44307.802083333336 | 18.038 |
| 44307.8125 | 17.954 |
| 44307.822916666664 | 17.844 |
| 44307.833333333336 | 17.928 |
| 44307.84375 | 17.926 |
| 44307.854166666664 | 17.917 |
| 44307.864583333336 | 17.995 |
| 44307.875 | 17.982 |
| 44307.885416666664 | 18.002 |
| 44307.895833333336 | 17.99 |
| 44307.90625 | 17.981 |
| 44307.916666666664 | 17.908 |
| 44307.927083333336 | 17.827 |
| 44307.9375 | 17.753 |
| 44307.947916666664 | 17.681 |
| 44307.958333333336 | 17.595 |
| 44307.96875 | 17.417 |
| 44307.979166666664 | 17.338 |
| 44307.989583333336 | 17.213 |
| 44308.0 | 17.105 |
| 44308.010416666664 | 17.036 |
| 44308.020833333336 | 16.969 |
| 44308.03125 | 16.863 |
| 44308.041666666664 | 16.782 |
| 44308.052083333336 | 16.713 |
| 44308.0625 | 16.602 |
| 44308.072916666664 | 16.603 |
| 44308.083333333336 | 16.517 |
| 44308.09375 | 16.422 |
| 44308.104166666664 | 16.325 |
| 44308.114583333336 | 16.266 |
| 44308.125 | 16.203 |
| 44308.135416666664 | 16.274 |
| 44308.145833333336 | 16.299 |
| 44308.15625 | 16.341 |
| 44308.166666666664 | 16.283 |
| 44308.177083333336 | 15.751 |
| 44308.1875 | 15.433 |
| 44308.197916666664 | 15.26 |
| 44308.208333333336 | 15.166 |
| 44308.21875 | 15.064 |
| 44308.229166666664 | 14.947 |
| 44308.239583333336 | 14.773 |
| 44308.25 | 14.614 |
| 44308.260416666664 | 14.444 |
| 44308.270833333336 | 14.338 |
| 44308.28125 | 14.207 |
| 44308.291666666664 | 14.079 |
| 44308.302083333336 | 14.005 |
| 44308.3125 | 13.912 |
| 44308.322916666664 | 13.922 |
| 44308.333333333336 | 13.86 |
| 44308.34375 | 13.808 |
| 44308.354166666664 | 13.774 |
| 44308.364583333336 | 13.731 |
| 44308.375 | 13.724 |
| 44308.385416666664 | 13.708 |
| 44308.395833333336 | 13.51 |
| 44308.40625 | 13.315 |
| 44308.416666666664 | 12.955 |
| 44308.427083333336 | 12.546 |
| 44308.4375 | 12.577 |
| 44308.447916666664 | 12.48 |
| 44308.458333333336 | 12.294 |
| 44308.46875 | 12.556 |
| 44308.479166666664 | 12.106 |
| 44308.489583333336 | 11.921 |
| 44308.5 | 12.098 |
| 44308.510416666664 | 12.006 |
| 44308.520833333336 | 12.132 |
| 44308.53125 | 12.013 |
| 44308.541666666664 | 12.027 |
| 44308.552083333336 | 11.951 |
| 44308.5625 | 12.089 |
| 44308.572916666664 | 11.941 |
| 44308.583333333336 | 11.992 |
| 44308.59375 | 12.164 |
| 44308.604166666664 | 12.157 |
| 44308.614583333336 | 12.1 |
| 44308.625 | 12.149 |
| 44308.635416666664 | 12.333 |
| 44308.645833333336 | 12.212 |
| 44308.65625 | 12.349 |
| 44308.666666666664 | 12.458 |
| 44308.677083333336 | 12.506 |
| 44308.6875 | 12.562 |
| 44308.697916666664 | 12.567 |
| 44308.708333333336 | 12.638 |
| 44308.71875 | 12.76 |
| 44308.729166666664 | 12.888 |
| 44308.739583333336 | 13.007 |
| 44308.75 | 13.18 |
| 44308.760416666664 | 13.366 |
| 44308.770833333336 | 13.538 |
| 44308.78125 | 13.725 |
| 44308.791666666664 | 13.839 |
| 44308.802083333336 | 13.976 |
| 44308.8125 | 14.104 |
| 44308.822916666664 | 14.176 |
| 44308.833333333336 | 14.256 |
| 44308.84375 | 14.321 |
| 44308.854166666664 | 14.347 |
| 44308.864583333336 | 14.37 |
| 44308.875 | 14.38 |
| 44308.885416666664 | 14.394 |
| 44308.895833333336 | 14.4 |
| 44308.90625 | 14.28 |
| 44308.916666666664 | 14.33 |
| 44308.927083333336 | 14.6 |
| 44308.9375 | 14.632 |
| 44308.947916666664 | 14.678 |
| 44308.958333333336 | 14.705 |
| 44308.96875 | 14.666 |
| 44308.979166666664 | 14.615 |
| 44308.989583333336 | 14.516 |
| 44309.0 | 14.599 |
| 44309.010416666664 | 14.462 |
| 44309.020833333336 | 14.297 |
| 44309.03125 | 14.02 |
| 44309.041666666664 | 13.879 |
| 44309.052083333336 | 13.784 |
| 44309.0625 | 13.685 |
| 44309.072916666664 | 13.621 |
| 44309.083333333336 | 13.541 |
| 44309.09375 | 13.538 |
| 44309.104166666664 | 13.506 |
| 44309.114583333336 | 13.436 |
| 44309.125 | 13.371 |
| 44309.135416666664 | 13.313 |
| 44309.145833333336 | 13.291 |
| 44309.15625 | 13.273 |
| 44309.166666666664 | 13.264 |
| 44309.177083333336 | 13.233 |
| 44309.1875 | 13.222 |
| 44309.197916666664 | 13.252 |
| 44309.208333333336 | 13.282 |
| 44309.21875 | 13.35 |
| 44309.229166666664 | 13.376 |
| 44309.239583333336 | 13.408 |
| 44309.25 | 13.407 |
| 44309.260416666664 | 13.405 |
| 44309.270833333336 | 13.39 |
| 44309.28125 | 13.293 |
| 44309.291666666664 | 13.189 |
| 44309.302083333336 | 13.105 |
| 44309.3125 | 13.004 |
| 44309.322916666664 | 12.914 |
| 44309.333333333336 | 12.849 |
| 44309.34375 | 12.791 |
| 44309.354166666664 | 12.721 |
| 44309.364583333336 | 12.653 |
| 44309.375 | 12.586 |
| 44309.385416666664 | 12.545 |
| 44309.395833333336 | 12.528 |
| 44309.40625 | 12.511 |
| 44309.416666666664 | 12.48 |
| 44309.427083333336 | 12.607 |
| 44309.4375 | 12.463 |
| 44309.447916666664 | 12.335 |
| 44309.458333333336 | 12.062 |
| 44309.46875 | 11.949 |
| 44309.479166666664 | 11.798 |
| 44309.489583333336 | 11.669 |
| 44309.5 | 11.784 |
| 44309.510416666664 | 11.684 |
| 44309.520833333336 | 11.694 |
| 44309.53125 | 11.802 |
| 44309.541666666664 | 11.819 |
| 44309.552083333336 | 11.865 |
| 44309.5625 | 11.931 |
| 44309.572916666664 | 11.976 |
| 44309.583333333336 | 12.096 |
| 44309.59375 | 12.021 |
| 44309.604166666664 | 12.199 |
| 44309.614583333336 | 12.273 |
| 44309.625 | 12.38 |
| 44309.635416666664 | 12.426 |
| 44309.645833333336 | 12.654 |
| 44309.65625 | 12.693 |
| 44309.666666666664 | 12.809 |
| 44309.677083333336 | 12.783 |
| 44309.6875 | 12.874 |
| 44309.697916666664 | 13.085 |
| 44309.708333333336 | 13.006 |
| 44309.71875 | 12.935 |
| 44309.729166666664 | 13.041 |
| 44309.739583333336 | 13.025 |
| 44309.75 | 13.214 |
| 44309.760416666664 | 13.313 |
| 44309.770833333336 | 13.409 |
| 44309.78125 | 13.565 |
| 44309.791666666664 | 13.885 |
| 44309.802083333336 | 14.493 |
| 44309.8125 | 15.048 |
| 44309.822916666664 | 15.531 |
| 44309.833333333336 | 15.605 |
| 44309.84375 | 15.702 |
| 44309.854166666664 | 15.807 |
| 44309.864583333336 | 15.707 |
| 44309.875 | 15.424 |
| 44309.885416666664 | 15.155 |
| 44309.895833333336 | 14.938 |
| 44309.90625 | 14.854 |
| 44309.916666666664 | 14.718 |
| 44309.927083333336 | 14.651 |
| 44309.9375 | 14.585 |
| 44309.947916666664 | 14.49 |
| 44309.958333333336 | 14.573 |
| 44309.96875 | 14.673 |
| 44309.979166666664 | 14.628 |
| 44309.989583333336 | 14.76 |
| 44310.0 | 14.603 |
| 44310.010416666664 | 14.622 |
| 44310.020833333336 | 14.67 |
| 44310.03125 | 14.613 |
| 44310.041666666664 | 14.618 |
| 44310.052083333336 | 14.794 |
| 44310.0625 | 14.65 |
| 44310.072916666664 | 14.441 |
| 44310.083333333336 | 14.224 |
| 44310.09375 | 14.111 |
| 44310.104166666664 | 14.014 |
| 44310.114583333336 | 13.941 |
| 44310.125 | 13.867 |
| 44310.135416666664 | 13.838 |
| 44310.145833333336 | 13.81 |
| 44310.15625 | 13.769 |
| 44310.166666666664 | 13.743 |
| 44310.177083333336 | 13.721 |
| 44310.1875 | 13.685 |
| 44310.197916666664 | 13.694 |
| 44310.208333333336 | 13.686 |
| 44310.21875 | 13.647 |
| 44310.229166666664 | 13.63 |
| 44310.239583333336 | 13.634 |
| 44310.25 | 13.639 |
| 44310.260416666664 | 13.653 |
| 44310.270833333336 | 13.717 |
| 44310.28125 | 13.723 |
| 44310.291666666664 | 13.756 |
| 44310.302083333336 | 13.803 |
| 44310.3125 | 13.79 |
| 44310.322916666664 | 13.681 |
| 44310.333333333336 | 13.531 |
| 44310.34375 | 13.404 |
| 44310.354166666664 | 13.28 |
| 44310.364583333336 | 13.156 |
| 44310.375 | 13.039 |
| 44310.385416666664 | 12.98 |
| 44310.395833333336 | 12.943 |
| 44310.40625 | 12.926 |
| 44310.416666666664 | 12.898 |
| 44310.427083333336 | 12.868 |
| 44310.4375 | 12.838 |
| 44310.447916666664 | 12.816 |
| 44310.458333333336 | 12.811 |
| 44310.46875 | 12.886 |
| 44310.479166666664 | 12.83 |
| 44310.489583333336 | 12.69 |
| 44310.5 | 12.607 |
| 44310.510416666664 | 12.631 |
| 44310.520833333336 | 12.474 |
| 44310.53125 | 12.587 |
| 44310.541666666664 | 12.702 |
| 44310.552083333336 | 12.773 |
| 44310.5625 | 12.749 |
| 44310.572916666664 | 12.847 |
| 44310.583333333336 | 12.993 |
| 44310.59375 | 13.129 |
| 44310.604166666664 | 13.227 |
| 44310.614583333336 | 13.305 |
| 44310.625 | 13.402 |
| 44310.635416666664 | 13.534 |
| 44310.645833333336 | 13.682 |
| 44310.65625 | 13.739 |
| 44310.666666666664 | 13.82 |
| 44310.677083333336 | 13.925 |
| 44310.6875 | 14.041 |
| 44310.697916666664 | 14.064 |
| 44310.708333333336 | 14.116 |
| 44310.71875 | 14.292 |
| 44310.729166666664 | 14.297 |
| 44310.739583333336 | 14.282 |
| 44310.75 | 14.254 |
| 44310.760416666664 | 14.327 |
| 44310.770833333336 | 14.285 |
| 44310.78125 | 14.42 |
| 44310.791666666664 | 14.576 |
| 44310.802083333336 | 14.666 |
| 44310.8125 | 14.822 |
| 44310.822916666664 | 15.081 |
| 44310.833333333336 | 15.383 |
| 44310.84375 | 15.58 |
| 44310.854166666664 | 15.689 |
| 44310.864583333336 | 15.759 |
| 44310.875 | 15.72 |
| 44310.885416666664 | 15.544 |
| 44310.895833333336 | 15.289 |
| 44310.90625 | 15.053 |
| 44310.916666666664 | 14.858 |
| 44310.927083333336 | 14.709 |
| 44310.9375 | 14.638 |
| 44310.947916666664 | 14.584 |
| 44310.958333333336 | 14.594 |
| 44310.96875 | 14.564 |
| 44310.979166666664 | 14.561 |
| 44310.989583333336 | 14.56 |
| 44311.0 | 14.686 |
| 44311.010416666664 | 14.665 |
| 44311.020833333336 | 14.622 |
| 44311.03125 | 14.598 |
| 44311.041666666664 | 14.738 |
| 44311.052083333336 | 14.689 |
| 44311.0625 | 14.727 |
| 44311.072916666664 | 14.728 |
| 44311.083333333336 | 14.745 |
| 44311.09375 | 14.768 |
| 44311.104166666664 | 14.782 |
| 44311.114583333336 | 14.824 |
| 44311.125 | 14.866 |
| 44311.135416666664 | 14.836 |
| 44311.145833333336 | 14.755 |
| 44311.15625 | 14.689 |
| 44311.166666666664 | 14.61 |
| 44311.177083333336 | 14.516 |
| 44311.1875 | 14.436 |
| 44311.197916666664 | 14.389 |
| 44311.208333333336 | 14.382 |
| 44311.21875 | 14.381 |
| 44311.229166666664 | 14.405 |
| 44311.239583333336 | 14.325 |
| 44311.25 | 14.417 |
| 44311.260416666664 | 14.432 |
| 44311.270833333336 | 14.466 |
| 44311.28125 | 14.47 |
| 44311.291666666664 | 14.5 |
| 44311.302083333336 | 14.498 |
| 44311.3125 | 14.472 |
| 44311.322916666664 | 14.416 |
| 44311.333333333336 | 14.407 |
| 44311.34375 | 14.384 |
| 44311.354166666664 | 14.335 |
| 44311.364583333336 | 14.281 |
| 44311.375 | 14.223 |
| 44311.385416666664 | 14.181 |
| 44311.395833333336 | 14.144 |
| 44311.40625 | 14.087 |
| 44311.416666666664 | 14.028 |
| 44311.427083333336 | 13.918 |
| 44311.4375 | 13.829 |
| 44311.447916666664 | 13.816 |
| 44311.458333333336 | 13.824 |
| 44311.46875 | 13.802 |
| 44311.479166666664 | 13.794 |
| 44311.489583333336 | 13.803 |
| 44311.5 | 13.811 |
| 44311.510416666664 | 13.81 |
| 44311.520833333336 | 13.868 |
| 44311.53125 | 13.801 |
| 44311.541666666664 | 13.787 |
| 44311.552083333336 | 13.796 |
| 44311.5625 | 13.811 |
| 44311.572916666664 | 13.803 |
| 44311.583333333336 | 13.847 |
| 44311.59375 | 13.929 |
| 44311.604166666664 | 13.973 |
| 44311.614583333336 | 14.063 |
| 44311.625 | 14.138 |
| 44311.635416666664 | 14.223 |
| 44311.645833333336 | 14.304 |
| 44311.65625 | 14.456 |
| 44311.666666666664 | 14.458 |
| 44311.677083333336 | 14.481 |
| 44311.6875 | 14.475 |
| 44311.697916666664 | 14.525 |
| 44311.708333333336 | 14.62 |
| 44311.71875 | 14.747 |
| 44311.729166666664 | 14.923 |
| 44311.739583333336 | 14.899 |
| 44311.75 | 15.052 |
| 44311.760416666664 | 15.088 |
| 44311.770833333336 | 15.083 |
| 44311.78125 | 14.955 |
| 44311.791666666664 | 14.988 |
| 44311.802083333336 | 15.038 |
| 44311.8125 | 15.045 |
| 44311.822916666664 | 15.101 |
| 44311.833333333336 | 15.252 |
| 44311.84375 | 15.426 |
| 44311.854166666664 | 15.609 |
| 44311.864583333336 | 15.757 |
| 44311.875 | 15.874 |
| 44311.885416666664 | 15.913 |
| 44311.895833333336 | 15.836 |
| 44311.90625 | 15.594 |
| 44311.916666666664 | 15.316 |
| 44311.927083333336 | 15.118 |
| 44311.9375 | 15.009 |
| 44311.947916666664 | 14.936 |
| 44311.958333333336 | 14.902 |
| 44311.96875 | 14.814 |
| 44311.979166666664 | 14.774 |
| 44311.989583333336 | 14.697 |
| 44312.0 | 14.589 |
| 44312.010416666664 | 14.489 |
| 44312.020833333336 | 14.436 |
| 44312.03125 | 14.398 |
| 44312.041666666664 | 14.477 |
| 44312.052083333336 | 14.526 |
| 44312.0625 | 14.481 |
| 44312.072916666664 | 14.576 |
| 44312.083333333336 | 14.605 |
| 44312.09375 | 14.642 |
| 44312.104166666664 | 14.721 |
| 44312.114583333336 | 14.8 |
| 44312.125 | 14.951 |
| 44312.135416666664 | 14.977 |
| 44312.145833333336 | 15.075 |
| 44312.15625 | 15.075 |
| 44312.166666666664 | 15.01 |
| 44312.177083333336 | 14.988 |
| 44312.1875 | 15.014 |
| 44312.197916666664 | 15.065 |
| 44312.208333333336 | 15.126 |
| 44312.21875 | 15.1 |
| 44312.229166666664 | 15.15 |
| 44312.239583333336 | 15.146 |
| 44312.25 | 15.122 |
| 44312.260416666664 | 15.093 |
| 44312.270833333336 | 15.003 |
| 44312.28125 | 15 |
| 44312.291666666664 | 14.977 |
| 44312.302083333336 | 14.963 |
| 44312.3125 | 14.967 |
| 44312.322916666664 | 14.991 |
| 44312.333333333336 | 14.976 |
| 44312.34375 | 14.913 |
| 44312.354166666664 | 14.686 |
| 44312.364583333336 | 14.497 |
| 44312.375 | 14.352 |
| 44312.385416666664 | 14.209 |
| 44312.395833333336 | 14.111 |
| 44312.40625 | 14.017 |
| 44312.416666666664 | 13.828 |
| 44312.427083333336 | 13.752 |
| 44312.4375 | 13.671 |
| 44312.447916666664 | 13.611 |
| 44312.458333333336 | 13.575 |
| 44312.46875 | 13.531 |
| 44312.479166666664 | 13.488 |
| 44312.489583333336 | 13.449 |
| 44312.5 | 13.427 |
| 44312.510416666664 | 13.448 |
| 44312.520833333336 | 13.499 |
| 44312.53125 | 13.545 |
| 44312.541666666664 | 13.636 |
| 44312.552083333336 | 13.681 |
| 44312.5625 | 13.664 |
| 44312.572916666664 | 13.69 |
| 44312.583333333336 | 13.681 |
| 44312.59375 | 13.691 |
| 44312.604166666664 | 13.846 |
| 44312.614583333336 | 13.974 |
| 44312.625 | 14.103 |
| 44312.635416666664 | 14.238 |
| 44312.645833333336 | 14.474 |
| 44312.65625 | 14.7 |
| 44312.666666666664 | 14.632 |
| 44312.677083333336 | 15.049 |
| 44312.6875 | 15.371 |
| 44312.697916666664 | 15.641 |
| 44312.708333333336 | 15.882 |
| 44312.71875 | 16.046 |
| 44312.729166666664 | 15.85 |
| 44312.739583333336 | 15.851 |
| 44312.75 | 16.051 |
| 44312.760416666664 | 16.121 |
| 44312.770833333336 | 16.154 |
| 44312.78125 | 16.246 |
| 44312.791666666664 | 16.283 |
| 44312.802083333336 | 16.284 |
| 44312.8125 | 16.229 |
| 44312.822916666664 | 16.118 |
| 44312.833333333336 | 16.123 |
| 44312.84375 | 16.048 |
| 44312.854166666664 | 15.924 |
| 44312.864583333336 | 16.009 |
| 44312.875 | 16.098 |
| 44312.885416666664 | 16.208 |
| 44312.895833333336 | 16.298 |
| 44312.90625 | 16.369 |
| 44312.916666666664 | 16.476 |
| 44312.927083333336 | 16.445 |
| 44312.9375 | 16.164 |
| 44312.947916666664 | 15.772 |
| 44312.958333333336 | 15.541 |
| 44312.96875 | 15.393 |
| 44312.979166666664 | 15.279 |
| 44312.989583333336 | 15.247 |
| 44313.0 | 15.201 |
| 44313.010416666664 | 15.136 |
| 44313.020833333336 | 15.037 |
| 44313.03125 | 14.953 |
| 44313.041666666664 | 14.878 |
| 44313.052083333336 | 14.809 |
| 44313.0625 | 14.754 |
| 44313.072916666664 | 14.87 |
| 44313.083333333336 | 14.914 |
| 44313.09375 | 14.744 |
| 44313.104166666664 | 14.869 |
| 44313.114583333336 | 14.902 |
| 44313.125 | 14.882 |
| 44313.135416666664 | 14.912 |
| 44313.145833333336 | 14.996 |
| 44313.15625 | 15.012 |
| 44313.166666666664 | 15.017 |
| 44313.177083333336 | 15.051 |
| 44313.1875 | 15.01 |
| 44313.197916666664 | 15.015 |
| 44313.208333333336 | 15.037 |
| 44313.21875 | 15.132 |
| 44313.229166666664 | 15.249 |
| 44313.239583333336 | 15.275 |
| 44313.25 | 15.313 |
| 44313.260416666664 | 15.328 |
| 44313.270833333336 | 15.291 |
| 44313.28125 | 15.279 |
| 44313.291666666664 | 15.263 |
| 44313.302083333336 | 15.24 |
| 44313.3125 | 15.163 |
| 44313.322916666664 | 15.138 |
| 44313.333333333336 | 15.136 |
| 44313.34375 | 15.125 |
| 44313.354166666664 | 15.148 |
| 44313.364583333336 | 15.158 |
| 44313.375 | 15.091 |
| 44313.385416666664 | 14.975 |
| 44313.395833333336 | 14.887 |
| 44313.40625 | 14.788 |
| 44313.416666666664 | 14.658 |
| 44313.427083333336 | 14.439 |
| 44313.4375 | 14.298 |
| 44313.447916666664 | 14.172 |
| 44313.458333333336 | 14.067 |
| 44313.46875 | 13.995 |
| 44313.479166666664 | 13.949 |
| 44313.489583333336 | 13.972 |
| 44313.5 | 13.976 |
| 44313.510416666664 | 13.972 |
| 44313.520833333336 | 13.974 |
| 44313.53125 | 14.006 |
| 44313.541666666664 | 14.09 |
| 44313.552083333336 | 14.19 |
| 44313.5625 | 14.276 |
| 44313.572916666664 | 14.425 |
| 44313.583333333336 | 14.381 |
| 44313.59375 | 14.583 |
| 44313.604166666664 | 14.825 |
| 44313.614583333336 | 15.089 |
| 44313.625 | 15.363 |
| 44313.635416666664 | 15.824 |
| 44313.645833333336 | 16.102 |
| 44313.65625 | 16.414 |
| 44313.666666666664 | 17.05 |
| 44313.677083333336 | 17.228 |
| 44313.6875 | 17.111 |
| 44313.697916666664 | 17.199 |
| 44313.708333333336 | 17.488 |
| 44313.71875 | 17.742 |
| 44313.729166666664 | 18.156 |
| 44313.739583333336 | 18.415 |
| 44313.75 | 18.592 |
| 44313.760416666664 | 18.53 |
| 44313.770833333336 | 18.644 |
| 44313.78125 | 18.849 |
| 44313.791666666664 | 18.873 |
| 44313.802083333336 | 19.029 |
| 44313.8125 | 19.1 |
| 44313.822916666664 | 19.195 |
| 44313.833333333336 | 19.404 |
| 44313.84375 | 19.255 |
| 44313.854166666664 | 19.064 |
| 44313.864583333336 | 18.949 |
| 44313.875 | 18.932 |
| 44313.885416666664 | 19.046 |
| 44313.895833333336 | 19.161 |
| 44313.90625 | 19.204 |
| 44313.916666666664 | 19.26 |
| 44313.927083333336 | 19.394 |
| 44313.9375 | 19.539 |
| 44313.947916666664 | 19.569 |
| 44313.958333333336 | 19.297 |
| 44313.96875 | 19.009 |
| 44313.979166666664 | 18.664 |
| 44313.989583333336 | 18.253 |
| 44314.0 | 17.959 |
| 44314.010416666664 | 17.71 |
| 44314.020833333336 | 17.542 |
| 44314.03125 | 17.548 |
| 44314.041666666664 | 17.514 |
| 44314.052083333336 | 17.448 |
| 44314.0625 | 17.344 |
| 44314.072916666664 | 17.171 |
| 44314.083333333336 | 17.045 |
| 44314.09375 | 16.966 |
| 44314.104166666664 | 16.859 |
| 44314.114583333336 | 17.14 |
| 44314.125 | 17.051 |
| 44314.135416666664 | 17.307 |
| 44314.145833333336 | 17.375 |
| 44314.15625 | 17.287 |
| 44314.166666666664 | 17.443 |
| 44314.177083333336 | 17.53 |
| 44314.1875 | 17.727 |
| 44314.197916666664 | 17.861 |
| 44314.208333333336 | 17.969 |
| 44314.21875 | 17.941 |
| 44314.229166666664 | 17.939 |
| 44314.239583333336 | 18.013 |
| 44314.25 | 18.116 |
| 44314.260416666664 | 18.183 |
| 44314.270833333336 | 18.302 |
| 44314.28125 | 18.317 |
| 44314.291666666664 | 18.164 |
| 44314.302083333336 | 18.275 |
| 44314.3125 | 18.261 |
| 44314.322916666664 | 18.271 |
| 44314.333333333336 | 18.236 |
| 44314.34375 | 18.183 |
| 44314.354166666664 | 18.143 |
| 44314.364583333336 | 18.084 |
| 44314.375 | 18.076 |
| 44314.385416666664 | 18.114 |
| 44314.395833333336 | 18.101 |
| 44314.40625 | 18.08 |
| 44314.416666666664 | 17.781 |
| 44314.427083333336 | 17.611 |
| 44314.4375 | 17.546 |
| 44314.447916666664 | 17.399 |
| 44314.458333333336 | 17.162 |
| 44314.46875 | 16.999 |
| 44314.479166666664 | 16.878 |
| 44314.489583333336 | 16.779 |
| 44314.5 | 16.744 |
| 44314.510416666664 | 16.685 |
| 44314.520833333336 | 16.595 |
| 44314.53125 | 16.544 |
| 44314.541666666664 | 16.547 |
| 44314.552083333336 | 16.598 |
| 44314.5625 | 16.703 |
| 44314.572916666664 | 16.787 |
| 44314.583333333336 | 16.845 |
| 44314.59375 | 16.916 |
| 44314.604166666664 | 16.982 |
| 44314.614583333336 | 17.001 |
| 44314.625 | 17.082 |
| 44314.635416666664 | 17.244 |
| 44314.645833333336 | 17.406 |
| 44314.65625 | 17.721 |
| 44314.666666666664 | 17.896 |
| 44314.677083333336 | 18.234 |
| 44314.6875 | 18.199 |
| 44314.697916666664 | 18.645 |
| 44314.708333333336 | 19.2 |
| 44314.71875 | 19.08 |
| 44314.729166666664 | 19.44 |
| 44314.739583333336 | 20.167 |
| 44314.75 | 20.783 |
| 44314.760416666664 | 20.972 |
| 44314.770833333336 | 21.289 |
| 44314.78125 | 21.341 |
| 44314.791666666664 | 21.302 |
| 44314.802083333336 | 21.456 |
| 44314.8125 | 21.579 |
| 44314.822916666664 | 21.736 |
| 44314.833333333336 | 22.017 |
| 44314.84375 | 22.22 |
| 44314.854166666664 | 22.075 |
| 44314.864583333336 | 22.045 |
| 44314.875 | 21.894 |
| 44314.885416666664 | 21.793 |
| 44314.895833333336 | 21.658 |
| 44314.90625 | 21.617 |
| 44314.916666666664 | 21.478 |
| 44314.927083333336 | 21.473 |
| 44314.9375 | 21.423 |
| 44314.947916666664 | 21.555 |
| 44314.958333333336 | 21.634 |
| 44314.96875 | 21.606 |
| 44314.979166666664 | 21.541 |
| 44314.989583333336 | 21.329 |
| 44315.0 | 20.945 |
| 44315.010416666664 | 20.477 |
| 44315.020833333336 | 19.988 |
| 44315.03125 | 19.663 |
| 44315.041666666664 | 19.549 |
| 44315.052083333336 | 19.51 |
| 44315.0625 | 19.535 |
| 44315.072916666664 | 19.54 |
| 44315.083333333336 | 19.487 |
| 44315.09375 | 19.332 |
| 44315.104166666664 | 19.113 |
| 44315.114583333336 | 18.99 |
| 44315.125 | 18.828 |
| 44315.135416666664 | 18.761 |
| 44315.145833333336 | 18.951 |
| 44315.15625 | 18.947 |
| 44315.166666666664 | 19.055 |
| 44315.177083333336 | 19.227 |
| 44315.1875 | 19.405 |
| 44315.197916666664 | 19.503 |
| 44315.208333333336 | 19.41 |
| 44315.21875 | 19.568 |
| 44315.229166666664 | 19.703 |
| 44315.239583333336 | 19.77 |
| 44315.25 | 19.882 |
| 44315.260416666664 | 19.908 |
| 44315.270833333336 | 19.943 |
| 44315.28125 | 19.993 |
| 44315.291666666664 | 20.038 |
| 44315.302083333336 | 20.217 |
| 44315.3125 | 20.352 |
| 44315.322916666664 | 20.374 |
| 44315.333333333336 | 20.466 |
| 44315.34375 | 20.547 |
| 44315.354166666664 | 20.607 |
| 44315.364583333336 | 20.635 |
| 44315.375 | 20.612 |
| 44315.385416666664 | 20.578 |
| 44315.395833333336 | 20.561 |
| 44315.40625 | 20.492 |
| 44315.416666666664 | 20.532 |
| 44315.427083333336 | 20.51 |
| 44315.4375 | 20.459 |
| 44315.447916666664 | 20.327 |
| 44315.458333333336 | 20.077 |
| 44315.46875 | 19.989 |
| 44315.479166666664 | 19.847 |
| 44315.489583333336 | 19.701 |
| 44315.5 | 19.589 |
| 44315.510416666664 | 19.454 |
| 44315.520833333336 | 19.366 |
| 44315.53125 | 19.278 |
| 44315.541666666664 | 19.216 |
| 44315.552083333336 | 19.098 |
| 44315.5625 | 18.931 |
| 44315.572916666664 | 18.851 |
| 44315.583333333336 | 18.772 |
| 44315.59375 | 18.728 |
| 44315.604166666664 | 18.776 |
| 44315.614583333336 | 18.841 |
| 44315.625 | 18.942 |
| 44315.635416666664 | 19.1 |
| 44315.645833333336 | 19.224 |
| 44315.65625 | 19.361 |
| 44315.666666666664 | 19.575 |
| 44315.677083333336 | 19.701 |
| 44315.6875 | 19.986 |
| 44315.697916666664 | 21.383 |
| 44315.708333333336 | 21.849 |
| 44315.71875 | 22.054 |
| 44315.729166666664 | 22.777 |
| 44315.739583333336 | 23.199 |
| 44315.75 | 23.114 |
| 44315.760416666664 | 23.516 |
| 44315.770833333336 | 22.529 |
| 44315.78125 | 23.109 |
| 44315.791666666664 | 23.59 |
| 44315.802083333336 | 23.86 |
| 44315.8125 | 24.085 |
| 44315.822916666664 | 24.133 |
| 44315.833333333336 | 24.23 |
| 44315.84375 | 24.344 |
| 44315.854166666664 | 24.324 |
| 44315.864583333336 | 24.412 |
| 44315.875 | 24.475 |
| 44315.885416666664 | 24.431 |
| 44315.895833333336 | 24.428 |
| 44315.90625 | 24.345 |
| 44315.916666666664 | 24.248 |
| 44315.927083333336 | 24.043 |
| 44315.9375 | 23.911 |
| 44315.947916666664 | 23.558 |
| 44315.958333333336 | 23.106 |
| 44315.96875 | 22.901 |
| 44315.979166666664 | 22.799 |
| 44315.989583333336 | 22.72 |
| 44316.0 | 22.704 |
| 44316.010416666664 | 22.71 |
| 44316.020833333336 | 22.593 |
| 44316.03125 | 22.361 |
| 44316.041666666664 | 22.079 |
| 44316.052083333336 | 21.776 |
| 44316.0625 | 21.518 |
| 44316.072916666664 | 21.357 |
| 44316.083333333336 | 21.333 |
| 44316.09375 | 21.364 |
| 44316.104166666664 | 21.374 |
| 44316.114583333336 | 21.302 |
| 44316.125 | 21.163 |
| 44316.135416666664 | 20.984 |
| 44316.145833333336 | 20.815 |
| 44316.15625 | 20.683 |
| 44316.166666666664 | 20.606 |
| 44316.177083333336 | 20.683 |
| 44316.1875 | 20.764 |
| 44316.197916666664 | 20.715 |
| 44316.208333333336 | 20.756 |
| 44316.21875 | 20.622 |
| 44316.229166666664 | 20.902 |
| 44316.239583333336 | 20.967 |
| 44316.25 | 20.987 |
| 44316.260416666664 | 20.988 |
| 44316.270833333336 | 21.009 |
| 44316.28125 | 21.001 |
| 44316.291666666664 | 20.985 |
| 44316.302083333336 | 20.939 |
| 44316.3125 | 20.913 |
| 44316.322916666664 | 20.959 |
| 44316.333333333336 | 21.063 |
| 44316.34375 | 21.302 |
| 44316.354166666664 | 21.407 |
| 44316.364583333336 | 21.382 |
| 44316.375 | 21.658 |
| 44316.385416666664 | 21.693 |
| 44316.395833333336 | 21.623 |
| 44316.40625 | 21.69 |
| 44316.416666666664 | 21.642 |
| 44316.427083333336 | 21.623 |
| 44316.4375 | 21.567 |
| 44316.447916666664 | 21.55 |
| 44316.458333333336 | 21.531 |
| 44316.46875 | 21.558 |
| 44316.479166666664 | 21.57 |
| 44316.489583333336 | 21.532 |
| 44316.5 | 21.289 |
| 44316.510416666664 | 21.014 |
| 44316.520833333336 | 20.803 |
| 44316.53125 | 20.682 |
| 44316.541666666664 | 20.597 |
| 44316.552083333336 | 20.563 |
| 44316.5625 | 20.507 |
| 44316.572916666664 | 20.382 |
| 44316.583333333336 | 20.3 |
| 44316.59375 | 20.26 |
| 44316.604166666664 | 20.178 |
| 44316.614583333336 | 20.08 |
| 44316.625 | 20.017 |
| 44316.635416666664 | 19.99 |
| 44316.645833333336 | 19.942 |
| 44316.65625 | 19.907 |
| 44316.666666666664 | 19.912 |
| 44316.677083333336 | 19.899 |
| 44316.6875 | 19.909 |
| 44316.697916666664 | 19.876 |
| 44316.708333333336 | 20.148 |
| 44316.71875 | 20.401 |
| 44316.729166666664 | 20.451 |
| 44316.739583333336 | 21.194 |
| 44316.75 | 21.48 |
| 44316.760416666664 | 21.394 |
| 44316.770833333336 | 21.782 |
| 44316.78125 | 21.873 |
| 44316.791666666664 | 22.024 |
| 44316.802083333336 | 22.274 |
| 44316.8125 | 22.555 |
| 44316.822916666664 | 22.844 |
| 44316.833333333336 | 23.024 |
| 44316.84375 | 23.334 |
| 44316.854166666664 | 23.462 |
| 44316.864583333336 | 23.667 |
| 44316.875 | 23.66 |
| 44316.885416666664 | 23.765 |
| 44316.895833333336 | 23.859 |
| 44316.90625 | 23.735 |
| 44316.916666666664 | 23.635 |
| 44316.927083333336 | 23.518 |
| 44316.9375 | 23.456 |
| 44316.947916666664 | 23.326 |
| 44316.958333333336 | 23.293 |
| 44316.96875 | 23.218 |
| 44316.979166666664 | 23.017 |
| 44316.989583333336 | 22.221 |
| 44317.0 | 22.062 |
| 44317.010416666664 | 21.797 |
| 44317.020833333336 | 21.689 |
| 44317.03125 | 21.562 |
| 44317.041666666664 | 21.335 |
| 44317.052083333336 | 21.017 |
| 44317.0625 | 20.7 |
| 44317.072916666664 | 20.354 |
| 44317.083333333336 | 19.926 |
| 44317.09375 | 19.531 |
| 44317.104166666664 | 19.33 |
| 44317.114583333336 | 19.196 |
| 44317.125 | 19.041 |
| 44317.135416666664 | 18.93 |
| 44317.145833333336 | 18.848 |
| 44317.15625 | 18.754 |